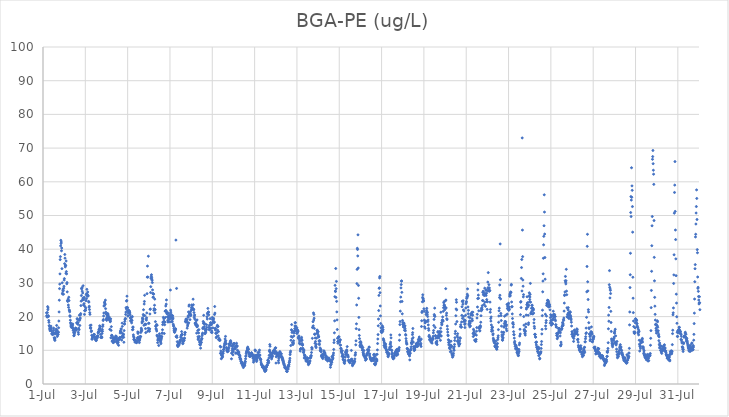
| Category | BGA-PE (ug/L) |
|---|---|
| 44743.166666666664 | 21.12 |
| 44743.177083333336 | 20.3 |
| 44743.1875 | 20.1 |
| 44743.197916666664 | 19.84 |
| 44743.208333333336 | 21.19 |
| 44743.21875 | 22.97 |
| 44743.229166666664 | 22.04 |
| 44743.239583333336 | 22.58 |
| 44743.25 | 20.28 |
| 44743.260416666664 | 20.04 |
| 44743.270833333336 | 18.84 |
| 44743.28125 | 18.29 |
| 44743.291666666664 | 17.28 |
| 44743.302083333336 | 17.31 |
| 44743.3125 | 16.57 |
| 44743.322916666664 | 16.19 |
| 44743.333333333336 | 15.8 |
| 44743.34375 | 16.29 |
| 44743.354166666664 | 16.54 |
| 44743.364583333336 | 16.58 |
| 44743.375 | 17.17 |
| 44743.385416666664 | 16.6 |
| 44743.395833333336 | 16.06 |
| 44743.40625 | 15.74 |
| 44743.416666666664 | 14.85 |
| 44743.427083333336 | 15.03 |
| 44743.4375 | 14.82 |
| 44743.447916666664 | 15.06 |
| 44743.458333333336 | 14.66 |
| 44743.46875 | 15.06 |
| 44743.479166666664 | 15.16 |
| 44743.489583333336 | 15.29 |
| 44743.5 | 16.59 |
| 44743.510416666664 | 15.95 |
| 44743.520833333336 | 14.82 |
| 44743.53125 | 13.74 |
| 44743.541666666664 | 13.53 |
| 44743.552083333336 | 13.15 |
| 44743.5625 | 12.93 |
| 44743.572916666664 | 13.64 |
| 44743.583333333336 | 15.24 |
| 44743.59375 | 15.05 |
| 44743.604166666664 | 14.91 |
| 44743.614583333336 | 15.3 |
| 44743.625 | 16.32 |
| 44743.635416666664 | 15.84 |
| 44743.645833333336 | 17.37 |
| 44743.65625 | 15.28 |
| 44743.666666666664 | 15.95 |
| 44743.677083333336 | 14.12 |
| 44743.6875 | 14.52 |
| 44743.697916666664 | 15.29 |
| 44743.708333333336 | 15.46 |
| 44743.71875 | 14.75 |
| 44743.729166666664 | 15.35 |
| 44743.739583333336 | 16.69 |
| 44743.75 | 18.69 |
| 44743.760416666664 | 21.38 |
| 44743.770833333336 | 24.87 |
| 44743.78125 | 28.3 |
| 44743.791666666664 | 29.64 |
| 44743.802083333336 | 32.67 |
| 44743.8125 | 36.91 |
| 44743.822916666664 | 37.8 |
| 44743.833333333336 | 40.99 |
| 44743.84375 | 42.64 |
| 44743.854166666664 | 41.68 |
| 44743.864583333336 | 42.12 |
| 44743.875 | 39.53 |
| 44743.885416666664 | 40.34 |
| 44743.895833333336 | 34.23 |
| 44743.90625 | 30.03 |
| 44743.916666666664 | 26.92 |
| 44743.927083333336 | 26.67 |
| 44743.9375 | 27.62 |
| 44743.947916666664 | 28.14 |
| 44743.958333333336 | 27.69 |
| 44743.96875 | 26.65 |
| 44743.979166666664 | 28.44 |
| 44743.989583333336 | 29 |
| 44744.0 | 30.83 |
| 44744.010416666664 | 31.28 |
| 44744.020833333336 | 35.7 |
| 44744.03125 | 38.43 |
| 44744.041666666664 | 37.33 |
| 44744.052083333336 | 34.75 |
| 44744.0625 | 35.27 |
| 44744.072916666664 | 35.12 |
| 44744.083333333336 | 32.86 |
| 44744.09375 | 36.5 |
| 44744.104166666664 | 33.36 |
| 44744.114583333336 | 32.68 |
| 44744.125 | 29.74 |
| 44744.135416666664 | 30.1 |
| 44744.145833333336 | 27.34 |
| 44744.15625 | 24.76 |
| 44744.166666666664 | 24.5 |
| 44744.177083333336 | 24.77 |
| 44744.1875 | 25.21 |
| 44744.197916666664 | 23.43 |
| 44744.208333333336 | 22.74 |
| 44744.21875 | 25.75 |
| 44744.229166666664 | 24.74 |
| 44744.239583333336 | 21.98 |
| 44744.25 | 21.78 |
| 44744.260416666664 | 21.42 |
| 44744.270833333336 | 20.27 |
| 44744.28125 | 20.04 |
| 44744.291666666664 | 18.94 |
| 44744.302083333336 | 18.18 |
| 44744.3125 | 17.83 |
| 44744.322916666664 | 17.14 |
| 44744.333333333336 | 17.37 |
| 44744.34375 | 16.8 |
| 44744.354166666664 | 17.37 |
| 44744.364583333336 | 17.05 |
| 44744.375 | 16.93 |
| 44744.385416666664 | 16.68 |
| 44744.395833333336 | 17.43 |
| 44744.40625 | 17.81 |
| 44744.416666666664 | 16.69 |
| 44744.427083333336 | 15.87 |
| 44744.4375 | 16.09 |
| 44744.447916666664 | 15.22 |
| 44744.458333333336 | 14.31 |
| 44744.46875 | 14.38 |
| 44744.479166666664 | 14.8 |
| 44744.489583333336 | 15.16 |
| 44744.5 | 15.48 |
| 44744.510416666664 | 16.16 |
| 44744.520833333336 | 16.21 |
| 44744.53125 | 16.24 |
| 44744.541666666664 | 16.63 |
| 44744.552083333336 | 16.45 |
| 44744.5625 | 16.45 |
| 44744.572916666664 | 15.98 |
| 44744.583333333336 | 16.16 |
| 44744.59375 | 18.15 |
| 44744.604166666664 | 18.1 |
| 44744.614583333336 | 19.41 |
| 44744.625 | 19.14 |
| 44744.635416666664 | 18.25 |
| 44744.645833333336 | 17.73 |
| 44744.65625 | 18.2 |
| 44744.666666666664 | 15.34 |
| 44744.677083333336 | 14.76 |
| 44744.6875 | 16.58 |
| 44744.697916666664 | 19.05 |
| 44744.708333333336 | 16.12 |
| 44744.71875 | 20.41 |
| 44744.729166666664 | 18.89 |
| 44744.739583333336 | 17.36 |
| 44744.75 | 19.31 |
| 44744.760416666664 | 19.59 |
| 44744.770833333336 | 20.5 |
| 44744.78125 | 20.89 |
| 44744.791666666664 | 23.27 |
| 44744.802083333336 | 24.59 |
| 44744.8125 | 26.25 |
| 44744.822916666664 | 28.25 |
| 44744.833333333336 | 28.36 |
| 44744.84375 | 28.62 |
| 44744.854166666664 | 27.55 |
| 44744.864583333336 | 24.91 |
| 44744.875 | 27 |
| 44744.885416666664 | 25.48 |
| 44744.895833333336 | 29.16 |
| 44744.90625 | 25.45 |
| 44744.916666666664 | 23.43 |
| 44744.927083333336 | 25.04 |
| 44744.9375 | 23.85 |
| 44744.947916666664 | 25.72 |
| 44744.958333333336 | 20.65 |
| 44744.96875 | 21.75 |
| 44744.979166666664 | 23 |
| 44744.989583333336 | 21.85 |
| 44745.0 | 21.78 |
| 44745.010416666664 | 21.91 |
| 44745.020833333336 | 22.55 |
| 44745.03125 | 24.71 |
| 44745.041666666664 | 26.51 |
| 44745.052083333336 | 25.31 |
| 44745.0625 | 26.76 |
| 44745.072916666664 | 28.1 |
| 44745.083333333336 | 26.65 |
| 44745.09375 | 26.04 |
| 44745.104166666664 | 26.41 |
| 44745.114583333336 | 27.31 |
| 44745.125 | 26.12 |
| 44745.135416666664 | 26.16 |
| 44745.15625 | 24.49 |
| 44745.166666666664 | 24.28 |
| 44745.177083333336 | 22.75 |
| 44745.1875 | 23.07 |
| 44745.197916666664 | 22.08 |
| 44745.208333333336 | 21.18 |
| 44745.21875 | 20.66 |
| 44745.229166666664 | 17.36 |
| 44745.239583333336 | 16.55 |
| 44745.25 | 16.7 |
| 44745.260416666664 | 16.62 |
| 44745.270833333336 | 17.48 |
| 44745.28125 | 15.53 |
| 44745.291666666664 | 15.8 |
| 44745.302083333336 | 14.45 |
| 44745.3125 | 13.34 |
| 44745.322916666664 | 13.3 |
| 44745.333333333336 | 13.61 |
| 44745.34375 | 13.98 |
| 44745.354166666664 | 13.91 |
| 44745.364583333336 | 14.03 |
| 44745.375 | 14.39 |
| 44745.385416666664 | 14.34 |
| 44745.395833333336 | 14.31 |
| 44745.40625 | 14.76 |
| 44745.416666666664 | 14.52 |
| 44745.427083333336 | 14.7 |
| 44745.4375 | 13.87 |
| 44745.447916666664 | 13.95 |
| 44745.458333333336 | 13.32 |
| 44745.46875 | 13.54 |
| 44745.479166666664 | 13.24 |
| 44745.489583333336 | 13.26 |
| 44745.5 | 13.09 |
| 44745.510416666664 | 12.85 |
| 44745.520833333336 | 12.98 |
| 44745.53125 | 13.48 |
| 44745.541666666664 | 14.07 |
| 44745.552083333336 | 13.65 |
| 44745.5625 | 13.72 |
| 44745.572916666664 | 14.02 |
| 44745.583333333336 | 14.29 |
| 44745.59375 | 14.28 |
| 44745.604166666664 | 15.15 |
| 44745.614583333336 | 15.24 |
| 44745.625 | 15.62 |
| 44745.635416666664 | 15.48 |
| 44745.645833333336 | 16.12 |
| 44745.65625 | 16.28 |
| 44745.666666666664 | 16.26 |
| 44745.677083333336 | 17.26 |
| 44745.6875 | 16.7 |
| 44745.697916666664 | 16.51 |
| 44745.708333333336 | 17.09 |
| 44745.71875 | 14.73 |
| 44745.729166666664 | 13.81 |
| 44745.739583333336 | 15.75 |
| 44745.75 | 13.98 |
| 44745.760416666664 | 13.86 |
| 44745.770833333336 | 14.04 |
| 44745.78125 | 13.77 |
| 44745.791666666664 | 15 |
| 44745.802083333336 | 16.19 |
| 44745.8125 | 15.63 |
| 44745.822916666664 | 17.09 |
| 44745.833333333336 | 17.55 |
| 44745.84375 | 18.84 |
| 44745.854166666664 | 19.14 |
| 44745.864583333336 | 20.17 |
| 44745.875 | 21.06 |
| 44745.885416666664 | 23.1 |
| 44745.895833333336 | 23.27 |
| 44745.90625 | 24.14 |
| 44745.916666666664 | 24.35 |
| 44745.927083333336 | 23.89 |
| 44745.9375 | 23.58 |
| 44745.947916666664 | 24.89 |
| 44745.958333333336 | 22.36 |
| 44745.96875 | 21.33 |
| 44745.979166666664 | 20.76 |
| 44745.989583333336 | 19.33 |
| 44746.0 | 19.11 |
| 44746.010416666664 | 18.89 |
| 44746.020833333336 | 19.81 |
| 44746.03125 | 20.47 |
| 44746.041666666664 | 20.87 |
| 44746.052083333336 | 20.25 |
| 44746.0625 | 20.9 |
| 44746.072916666664 | 20.62 |
| 44746.083333333336 | 19.77 |
| 44746.09375 | 19.33 |
| 44746.104166666664 | 19.32 |
| 44746.114583333336 | 20.01 |
| 44746.125 | 19.2 |
| 44746.135416666664 | 19.43 |
| 44746.145833333336 | 18.96 |
| 44746.15625 | 16.22 |
| 44746.166666666664 | 19.38 |
| 44746.177083333336 | 18.47 |
| 44746.1875 | 18.71 |
| 44746.197916666664 | 19.33 |
| 44746.208333333336 | 13.71 |
| 44746.21875 | 15.91 |
| 44746.229166666664 | 17.01 |
| 44746.239583333336 | 14.35 |
| 44746.25 | 14.47 |
| 44746.260416666664 | 14.36 |
| 44746.270833333336 | 12.67 |
| 44746.28125 | 12.88 |
| 44746.291666666664 | 12.73 |
| 44746.302083333336 | 13.62 |
| 44746.3125 | 12.31 |
| 44746.322916666664 | 12.81 |
| 44746.333333333336 | 12.29 |
| 44746.34375 | 13.82 |
| 44746.354166666664 | 13.52 |
| 44746.364583333336 | 12.58 |
| 44746.375 | 13.25 |
| 44746.385416666664 | 13.51 |
| 44746.395833333336 | 13.51 |
| 44746.40625 | 13.75 |
| 44746.416666666664 | 13.28 |
| 44746.427083333336 | 13.3 |
| 44746.4375 | 14.24 |
| 44746.447916666664 | 13.61 |
| 44746.458333333336 | 12.53 |
| 44746.46875 | 14.11 |
| 44746.479166666664 | 13.69 |
| 44746.489583333336 | 13.25 |
| 44746.5 | 12.7 |
| 44746.510416666664 | 12.62 |
| 44746.520833333336 | 11.98 |
| 44746.53125 | 12.93 |
| 44746.541666666664 | 12.23 |
| 44746.552083333336 | 12.44 |
| 44746.5625 | 13.29 |
| 44746.572916666664 | 11.48 |
| 44746.583333333336 | 13.48 |
| 44746.59375 | 13.54 |
| 44746.604166666664 | 13.26 |
| 44746.614583333336 | 13.24 |
| 44746.625 | 13.83 |
| 44746.635416666664 | 13.76 |
| 44746.645833333336 | 15.13 |
| 44746.65625 | 15.73 |
| 44746.666666666664 | 15.51 |
| 44746.677083333336 | 15.51 |
| 44746.6875 | 16.35 |
| 44746.697916666664 | 16.3 |
| 44746.708333333336 | 13.96 |
| 44746.71875 | 13.03 |
| 44746.729166666664 | 15.12 |
| 44746.739583333336 | 18.06 |
| 44746.75 | 17.1 |
| 44746.760416666664 | 13.79 |
| 44746.770833333336 | 14.31 |
| 44746.78125 | 14.35 |
| 44746.791666666664 | 14.74 |
| 44746.802083333336 | 14.79 |
| 44746.8125 | 13.85 |
| 44746.822916666664 | 12.39 |
| 44746.833333333336 | 15.85 |
| 44746.84375 | 17.89 |
| 44746.854166666664 | 17.76 |
| 44746.864583333336 | 18.56 |
| 44746.875 | 19.12 |
| 44746.885416666664 | 19.3 |
| 44746.895833333336 | 19.47 |
| 44746.90625 | 20.65 |
| 44746.916666666664 | 21.34 |
| 44746.927083333336 | 22.67 |
| 44746.9375 | 22.31 |
| 44746.947916666664 | 24.6 |
| 44746.958333333336 | 24.77 |
| 44746.96875 | 26.06 |
| 44746.979166666664 | 22.76 |
| 44746.989583333336 | 21.73 |
| 44747.0 | 22.61 |
| 44747.010416666664 | 20.21 |
| 44747.020833333336 | 20.21 |
| 44747.03125 | 21.06 |
| 44747.041666666664 | 21.89 |
| 44747.052083333336 | 21.44 |
| 44747.0625 | 21.74 |
| 44747.072916666664 | 21.46 |
| 44747.083333333336 | 21.64 |
| 44747.09375 | 21.24 |
| 44747.104166666664 | 21.06 |
| 44747.114583333336 | 20.53 |
| 44747.125 | 19.59 |
| 44747.135416666664 | 18.73 |
| 44747.145833333336 | 19.73 |
| 44747.15625 | 19.72 |
| 44747.166666666664 | 19.01 |
| 44747.177083333336 | 18.78 |
| 44747.1875 | 18.14 |
| 44747.197916666664 | 19.77 |
| 44747.208333333336 | 18.87 |
| 44747.21875 | 20.04 |
| 44747.229166666664 | 16.11 |
| 44747.239583333336 | 16.84 |
| 44747.25 | 16.2 |
| 44747.260416666664 | 16.9 |
| 44747.270833333336 | 14.58 |
| 44747.28125 | 14.1 |
| 44747.291666666664 | 13.21 |
| 44747.302083333336 | 13.72 |
| 44747.3125 | 13.25 |
| 44747.322916666664 | 13.03 |
| 44747.333333333336 | 12.99 |
| 44747.34375 | 12.43 |
| 44747.354166666664 | 12.78 |
| 44747.364583333336 | 12.63 |
| 44747.375 | 12.61 |
| 44747.385416666664 | 12.9 |
| 44747.395833333336 | 12.65 |
| 44747.40625 | 12.33 |
| 44747.416666666664 | 12.27 |
| 44747.427083333336 | 12.32 |
| 44747.4375 | 12.52 |
| 44747.447916666664 | 12.81 |
| 44747.458333333336 | 13.45 |
| 44747.46875 | 13.76 |
| 44747.479166666664 | 15.45 |
| 44747.489583333336 | 15 |
| 44747.5 | 15.3 |
| 44747.510416666664 | 13.9 |
| 44747.520833333336 | 13.33 |
| 44747.53125 | 13.47 |
| 44747.541666666664 | 12.84 |
| 44747.552083333336 | 12.28 |
| 44747.5625 | 12.94 |
| 44747.572916666664 | 13.34 |
| 44747.583333333336 | 13.63 |
| 44747.59375 | 14.11 |
| 44747.604166666664 | 14.06 |
| 44747.614583333336 | 14.09 |
| 44747.625 | 15.29 |
| 44747.635416666664 | 15.69 |
| 44747.645833333336 | 16.56 |
| 44747.65625 | 16.18 |
| 44747.666666666664 | 15.82 |
| 44747.677083333336 | 18.13 |
| 44747.6875 | 18.58 |
| 44747.697916666664 | 19.57 |
| 44747.708333333336 | 19.23 |
| 44747.71875 | 18.59 |
| 44747.729166666664 | 19.34 |
| 44747.739583333336 | 20.62 |
| 44747.75 | 22.04 |
| 44747.760416666664 | 20.27 |
| 44747.770833333336 | 17.42 |
| 44747.78125 | 23.73 |
| 44747.791666666664 | 24.49 |
| 44747.802083333336 | 26.32 |
| 44747.8125 | 20.3 |
| 44747.822916666664 | 17.81 |
| 44747.833333333336 | 17.66 |
| 44747.84375 | 16.43 |
| 44747.854166666664 | 15.24 |
| 44747.864583333336 | 17.7 |
| 44747.875 | 19.24 |
| 44747.885416666664 | 18.94 |
| 44747.895833333336 | 19.64 |
| 44747.90625 | 21.08 |
| 44747.916666666664 | 26.81 |
| 44747.927083333336 | 31.72 |
| 44747.9375 | 34.99 |
| 44747.947916666664 | 15.63 |
| 44747.958333333336 | 31.72 |
| 44747.96875 | 16.55 |
| 44747.979166666664 | 37.92 |
| 44747.989583333336 | 18.04 |
| 44748.0 | 15.9 |
| 44748.010416666664 | 18 |
| 44748.020833333336 | 16.32 |
| 44748.03125 | 15.63 |
| 44748.041666666664 | 16.37 |
| 44748.052083333336 | 20.78 |
| 44748.0625 | 22.17 |
| 44748.072916666664 | 22.23 |
| 44748.083333333336 | 27.14 |
| 44748.09375 | 28.88 |
| 44748.104166666664 | 31.34 |
| 44748.114583333336 | 31.96 |
| 44748.125 | 32.43 |
| 44748.135416666664 | 31.63 |
| 44748.145833333336 | 31.12 |
| 44748.15625 | 30.76 |
| 44748.166666666664 | 30.1 |
| 44748.177083333336 | 27.92 |
| 44748.1875 | 26.81 |
| 44748.197916666664 | 25.73 |
| 44748.208333333336 | 26.84 |
| 44748.21875 | 25.73 |
| 44748.229166666664 | 26.65 |
| 44748.239583333336 | 21.86 |
| 44748.25 | 22.33 |
| 44748.260416666664 | 22.29 |
| 44748.270833333336 | 23.37 |
| 44748.28125 | 25.19 |
| 44748.291666666664 | 21.13 |
| 44748.302083333336 | 22.06 |
| 44748.3125 | 18.51 |
| 44748.322916666664 | 17.15 |
| 44748.333333333336 | 17.21 |
| 44748.34375 | 16.46 |
| 44748.354166666664 | 16.16 |
| 44748.364583333336 | 17.65 |
| 44748.375 | 15.72 |
| 44748.385416666664 | 14.47 |
| 44748.395833333336 | 17.44 |
| 44748.40625 | 14.1 |
| 44748.416666666664 | 12.26 |
| 44748.427083333336 | 12.99 |
| 44748.4375 | 13.17 |
| 44748.447916666664 | 13.48 |
| 44748.458333333336 | 13.05 |
| 44748.46875 | 11.43 |
| 44748.479166666664 | 13.39 |
| 44748.489583333336 | 14.14 |
| 44748.5 | 14.89 |
| 44748.510416666664 | 14.38 |
| 44748.520833333336 | 13 |
| 44748.53125 | 14.2 |
| 44748.541666666664 | 13.62 |
| 44748.552083333336 | 12.72 |
| 44748.5625 | 12.38 |
| 44748.572916666664 | 11.97 |
| 44748.583333333336 | 13.08 |
| 44748.59375 | 13.48 |
| 44748.604166666664 | 14.14 |
| 44748.614583333336 | 14 |
| 44748.625 | 15.03 |
| 44748.635416666664 | 15.17 |
| 44748.645833333336 | 16.1 |
| 44748.65625 | 17.61 |
| 44748.666666666664 | 18.29 |
| 44748.677083333336 | 18.42 |
| 44748.6875 | 19.79 |
| 44748.697916666664 | 18.38 |
| 44748.708333333336 | 19.33 |
| 44748.71875 | 18.58 |
| 44748.729166666664 | 14.98 |
| 44748.739583333336 | 18.33 |
| 44748.75 | 17.59 |
| 44748.760416666664 | 18.35 |
| 44748.770833333336 | 21.61 |
| 44748.78125 | 19.73 |
| 44748.791666666664 | 21.61 |
| 44748.802083333336 | 23.15 |
| 44748.8125 | 21.82 |
| 44748.822916666664 | 23.7 |
| 44748.833333333336 | 24.94 |
| 44748.84375 | 21.17 |
| 44748.854166666664 | 20.98 |
| 44748.864583333336 | 20.79 |
| 44748.875 | 21.3 |
| 44748.885416666664 | 19.96 |
| 44748.895833333336 | 18.93 |
| 44748.90625 | 18.37 |
| 44748.916666666664 | 18.54 |
| 44748.927083333336 | 19.57 |
| 44748.9375 | 19.85 |
| 44748.947916666664 | 20.93 |
| 44748.958333333336 | 20.19 |
| 44748.96875 | 20.29 |
| 44748.979166666664 | 20.09 |
| 44748.989583333336 | 19.21 |
| 44749.0 | 18.43 |
| 44749.010416666664 | 20.25 |
| 44749.020833333336 | 27.88 |
| 44749.03125 | 21.89 |
| 44749.041666666664 | 21.33 |
| 44749.052083333336 | 20.72 |
| 44749.0625 | 19.86 |
| 44749.072916666664 | 19.49 |
| 44749.083333333336 | 19.68 |
| 44749.09375 | 18.44 |
| 44749.104166666664 | 18.63 |
| 44749.114583333336 | 20.27 |
| 44749.125 | 20.24 |
| 44749.135416666664 | 19.29 |
| 44749.145833333336 | 19.57 |
| 44749.15625 | 17.74 |
| 44749.166666666664 | 17.33 |
| 44749.177083333336 | 17.05 |
| 44749.1875 | 16.41 |
| 44749.197916666664 | 15.91 |
| 44749.208333333336 | 15.5 |
| 44749.21875 | 15.32 |
| 44749.229166666664 | 16 |
| 44749.239583333336 | 15.67 |
| 44749.25 | 15.96 |
| 44749.260416666664 | 16.42 |
| 44749.270833333336 | 16.29 |
| 44749.28125 | 42.71 |
| 44749.291666666664 | 14.03 |
| 44749.302083333336 | 13.98 |
| 44749.3125 | 28.36 |
| 44749.322916666664 | 14.31 |
| 44749.333333333336 | 13.84 |
| 44749.34375 | 12.56 |
| 44749.354166666664 | 11.55 |
| 44749.364583333336 | 11.34 |
| 44749.375 | 11.11 |
| 44749.385416666664 | 11.39 |
| 44749.395833333336 | 12 |
| 44749.40625 | 12.1 |
| 44749.416666666664 | 11.46 |
| 44749.427083333336 | 11.69 |
| 44749.4375 | 11.95 |
| 44749.447916666664 | 12.26 |
| 44749.458333333336 | 12.47 |
| 44749.46875 | 12.78 |
| 44749.479166666664 | 12.88 |
| 44749.489583333336 | 13.12 |
| 44749.5 | 13.03 |
| 44749.510416666664 | 13.91 |
| 44749.520833333336 | 13.97 |
| 44749.53125 | 14.49 |
| 44749.541666666664 | 14.42 |
| 44749.552083333336 | 15.55 |
| 44749.5625 | 14.69 |
| 44749.572916666664 | 14.75 |
| 44749.583333333336 | 13.46 |
| 44749.59375 | 12.51 |
| 44749.604166666664 | 11.96 |
| 44749.614583333336 | 12.11 |
| 44749.625 | 12.52 |
| 44749.635416666664 | 12.73 |
| 44749.645833333336 | 12.88 |
| 44749.65625 | 12.96 |
| 44749.666666666664 | 13.02 |
| 44749.677083333336 | 13.47 |
| 44749.6875 | 13.63 |
| 44749.697916666664 | 14.64 |
| 44749.708333333336 | 15.22 |
| 44749.71875 | 15.28 |
| 44749.729166666664 | 18.63 |
| 44749.739583333336 | 18.45 |
| 44749.75 | 19.23 |
| 44749.760416666664 | 18.41 |
| 44749.770833333336 | 18.56 |
| 44749.78125 | 19.25 |
| 44749.791666666664 | 19.1 |
| 44749.802083333336 | 18.99 |
| 44749.8125 | 16.57 |
| 44749.822916666664 | 18.2 |
| 44749.833333333336 | 17.22 |
| 44749.84375 | 17.59 |
| 44749.854166666664 | 20.15 |
| 44749.864583333336 | 19.82 |
| 44749.875 | 21.38 |
| 44749.885416666664 | 18.15 |
| 44749.895833333336 | 23.12 |
| 44749.90625 | 23.45 |
| 44749.916666666664 | 20.65 |
| 44749.927083333336 | 20.79 |
| 44749.9375 | 20.92 |
| 44749.947916666664 | 19.1 |
| 44749.958333333336 | 21.36 |
| 44749.96875 | 20.24 |
| 44749.979166666664 | 20.66 |
| 44749.989583333336 | 20.42 |
| 44750.0 | 21.8 |
| 44750.010416666664 | 22.67 |
| 44750.020833333336 | 22.12 |
| 44750.03125 | 23.47 |
| 44750.041666666664 | 23.33 |
| 44750.052083333336 | 22.19 |
| 44750.0625 | 23.29 |
| 44750.072916666664 | 22.37 |
| 44750.083333333336 | 22.39 |
| 44750.09375 | 25.17 |
| 44750.104166666664 | 23.51 |
| 44750.114583333336 | 22.2 |
| 44750.125 | 22.03 |
| 44750.135416666664 | 21.2 |
| 44750.145833333336 | 19.69 |
| 44750.15625 | 20.18 |
| 44750.166666666664 | 20.52 |
| 44750.177083333336 | 19.23 |
| 44750.1875 | 18.08 |
| 44750.197916666664 | 18.03 |
| 44750.208333333336 | 17.77 |
| 44750.21875 | 17.47 |
| 44750.229166666664 | 18.06 |
| 44750.239583333336 | 18.77 |
| 44750.25 | 17.7 |
| 44750.260416666664 | 15.1 |
| 44750.270833333336 | 16.99 |
| 44750.28125 | 19.02 |
| 44750.291666666664 | 17 |
| 44750.302083333336 | 17.39 |
| 44750.3125 | 15.85 |
| 44750.322916666664 | 14.02 |
| 44750.333333333336 | 13.18 |
| 44750.34375 | 13.47 |
| 44750.354166666664 | 15.15 |
| 44750.364583333336 | 16.12 |
| 44750.375 | 14.06 |
| 44750.385416666664 | 14 |
| 44750.395833333336 | 12.45 |
| 44750.40625 | 11.76 |
| 44750.416666666664 | 12.77 |
| 44750.427083333336 | 11.56 |
| 44750.4375 | 11.67 |
| 44750.447916666664 | 10.64 |
| 44750.458333333336 | 12.67 |
| 44750.46875 | 12.32 |
| 44750.479166666664 | 12.27 |
| 44750.489583333336 | 13.11 |
| 44750.5 | 13.53 |
| 44750.510416666664 | 13.43 |
| 44750.520833333336 | 14.33 |
| 44750.53125 | 14.81 |
| 44750.541666666664 | 15.11 |
| 44750.552083333336 | 16.43 |
| 44750.5625 | 16.74 |
| 44750.572916666664 | 18.55 |
| 44750.583333333336 | 17.98 |
| 44750.59375 | 20.38 |
| 44750.604166666664 | 18.08 |
| 44750.614583333336 | 18.05 |
| 44750.625 | 17.06 |
| 44750.635416666664 | 16.38 |
| 44750.645833333336 | 17.82 |
| 44750.65625 | 14.91 |
| 44750.666666666664 | 15.16 |
| 44750.677083333336 | 15.83 |
| 44750.6875 | 15.3 |
| 44750.697916666664 | 15.76 |
| 44750.708333333336 | 16.02 |
| 44750.71875 | 16.23 |
| 44750.729166666664 | 17.58 |
| 44750.739583333336 | 16.79 |
| 44750.75 | 19.96 |
| 44750.760416666664 | 19.29 |
| 44750.770833333336 | 20.98 |
| 44750.78125 | 20.72 |
| 44750.791666666664 | 22.43 |
| 44750.802083333336 | 21.11 |
| 44750.8125 | 21.32 |
| 44750.822916666664 | 21.33 |
| 44750.833333333336 | 20.52 |
| 44750.84375 | 16.81 |
| 44750.854166666664 | 16.15 |
| 44750.864583333336 | 17.42 |
| 44750.875 | 16.06 |
| 44750.885416666664 | 16.5 |
| 44750.895833333336 | 19.4 |
| 44750.90625 | 17.47 |
| 44750.916666666664 | 18.12 |
| 44750.927083333336 | 18.21 |
| 44750.9375 | 17.56 |
| 44750.947916666664 | 16.53 |
| 44750.958333333336 | 15.33 |
| 44750.96875 | 17.67 |
| 44750.979166666664 | 15.71 |
| 44750.989583333336 | 15.27 |
| 44751.0 | 19.73 |
| 44751.010416666664 | 19.12 |
| 44751.020833333336 | 18.26 |
| 44751.03125 | 16.65 |
| 44751.041666666664 | 18.32 |
| 44751.052083333336 | 19.16 |
| 44751.0625 | 19.49 |
| 44751.072916666664 | 18.39 |
| 44751.083333333336 | 18.5 |
| 44751.09375 | 18.26 |
| 44751.104166666664 | 20.6 |
| 44751.114583333336 | 22.99 |
| 44751.125 | 21.04 |
| 44751.135416666664 | 16.52 |
| 44751.145833333336 | 16.03 |
| 44751.15625 | 16.41 |
| 44751.166666666664 | 15.09 |
| 44751.177083333336 | 15.01 |
| 44751.1875 | 13.74 |
| 44751.197916666664 | 15.23 |
| 44751.208333333336 | 14.06 |
| 44751.21875 | 15.15 |
| 44751.229166666664 | 17.12 |
| 44751.239583333336 | 17.42 |
| 44751.25 | 15.99 |
| 44751.260416666664 | 17.01 |
| 44751.270833333336 | 17.12 |
| 44751.28125 | 14.28 |
| 44751.291666666664 | 15.56 |
| 44751.302083333336 | 13.15 |
| 44751.3125 | 13.15 |
| 44751.322916666664 | 13.56 |
| 44751.333333333336 | 13.14 |
| 44751.34375 | 12.95 |
| 44751.354166666664 | 12.94 |
| 44751.364583333336 | 13.08 |
| 44751.375 | 11.19 |
| 44751.385416666664 | 9.1 |
| 44751.395833333336 | 10.98 |
| 44751.40625 | 9.79 |
| 44751.416666666664 | 9.05 |
| 44751.427083333336 | 7.49 |
| 44751.4375 | 8.48 |
| 44751.447916666664 | 8.63 |
| 44751.458333333336 | 7.78 |
| 44751.46875 | 8.99 |
| 44751.479166666664 | 8.38 |
| 44751.489583333336 | 8.06 |
| 44751.5 | 9.18 |
| 44751.510416666664 | 9.05 |
| 44751.520833333336 | 9.62 |
| 44751.53125 | 10.24 |
| 44751.541666666664 | 10.24 |
| 44751.552083333336 | 11.05 |
| 44751.5625 | 10.83 |
| 44751.572916666664 | 11.51 |
| 44751.583333333336 | 11.9 |
| 44751.59375 | 12.16 |
| 44751.604166666664 | 13.37 |
| 44751.614583333336 | 12.51 |
| 44751.625 | 14.13 |
| 44751.635416666664 | 12.86 |
| 44751.645833333336 | 11.85 |
| 44751.65625 | 12 |
| 44751.666666666664 | 10.83 |
| 44751.677083333336 | 10.43 |
| 44751.6875 | 9.9 |
| 44751.697916666664 | 9.82 |
| 44751.708333333336 | 9.74 |
| 44751.71875 | 9.58 |
| 44751.729166666664 | 10.17 |
| 44751.739583333336 | 9.74 |
| 44751.75 | 10.23 |
| 44751.760416666664 | 9.81 |
| 44751.770833333336 | 10.61 |
| 44751.78125 | 10.92 |
| 44751.791666666664 | 11.62 |
| 44751.802083333336 | 11.85 |
| 44751.8125 | 11.95 |
| 44751.822916666664 | 11.94 |
| 44751.833333333336 | 12.14 |
| 44751.84375 | 11.83 |
| 44751.854166666664 | 12.59 |
| 44751.864583333336 | 12.87 |
| 44751.875 | 12.13 |
| 44751.885416666664 | 12.43 |
| 44751.895833333336 | 11.32 |
| 44751.90625 | 7.47 |
| 44751.916666666664 | 9.11 |
| 44751.927083333336 | 9.26 |
| 44751.9375 | 9.95 |
| 44751.947916666664 | 10.51 |
| 44751.958333333336 | 11.52 |
| 44751.96875 | 11.11 |
| 44751.979166666664 | 8.64 |
| 44751.989583333336 | 9.59 |
| 44752.0 | 11.57 |
| 44752.010416666664 | 11.99 |
| 44752.020833333336 | 10.25 |
| 44752.03125 | 12.04 |
| 44752.041666666664 | 11.95 |
| 44752.052083333336 | 10.53 |
| 44752.0625 | 10.68 |
| 44752.072916666664 | 10.47 |
| 44752.083333333336 | 10.53 |
| 44752.09375 | 11.15 |
| 44752.104166666664 | 9.22 |
| 44752.114583333336 | 11.15 |
| 44752.125 | 9.11 |
| 44752.135416666664 | 11.46 |
| 44752.145833333336 | 12.1 |
| 44752.15625 | 11.28 |
| 44752.166666666664 | 11.11 |
| 44752.177083333336 | 11.31 |
| 44752.1875 | 10.04 |
| 44752.197916666664 | 9.32 |
| 44752.208333333336 | 9.23 |
| 44752.21875 | 9.7 |
| 44752.229166666664 | 9.24 |
| 44752.239583333336 | 8.79 |
| 44752.25 | 9.02 |
| 44752.260416666664 | 9.47 |
| 44752.270833333336 | 8.67 |
| 44752.28125 | 8.49 |
| 44752.291666666664 | 7.85 |
| 44752.302083333336 | 8.44 |
| 44752.3125 | 8.02 |
| 44752.322916666664 | 7.29 |
| 44752.333333333336 | 7.51 |
| 44752.34375 | 7.3 |
| 44752.354166666664 | 6.75 |
| 44752.364583333336 | 6.75 |
| 44752.375 | 6.09 |
| 44752.385416666664 | 6.46 |
| 44752.395833333336 | 6.34 |
| 44752.40625 | 6.15 |
| 44752.416666666664 | 6.34 |
| 44752.427083333336 | 5.44 |
| 44752.4375 | 5.85 |
| 44752.447916666664 | 5.96 |
| 44752.458333333336 | 5.53 |
| 44752.46875 | 4.88 |
| 44752.479166666664 | 5.45 |
| 44752.489583333336 | 5.47 |
| 44752.5 | 5.29 |
| 44752.510416666664 | 5.79 |
| 44752.520833333336 | 5.72 |
| 44752.53125 | 5.46 |
| 44752.541666666664 | 6.16 |
| 44752.552083333336 | 6.74 |
| 44752.5625 | 6.57 |
| 44752.572916666664 | 7.47 |
| 44752.583333333336 | 8.19 |
| 44752.59375 | 8.38 |
| 44752.604166666664 | 9.02 |
| 44752.614583333336 | 9.45 |
| 44752.625 | 9.5 |
| 44752.635416666664 | 9.82 |
| 44752.645833333336 | 10.02 |
| 44752.65625 | 10.65 |
| 44752.666666666664 | 10.43 |
| 44752.677083333336 | 10.96 |
| 44752.6875 | 10.62 |
| 44752.697916666664 | 10.2 |
| 44752.708333333336 | 10.33 |
| 44752.71875 | 9.42 |
| 44752.729166666664 | 8.87 |
| 44752.739583333336 | 9.23 |
| 44752.75 | 8.79 |
| 44752.760416666664 | 8.18 |
| 44752.770833333336 | 8.27 |
| 44752.78125 | 8.26 |
| 44752.791666666664 | 8.45 |
| 44752.802083333336 | 8.42 |
| 44752.8125 | 8.24 |
| 44752.822916666664 | 8.37 |
| 44752.833333333336 | 8.69 |
| 44752.84375 | 9.2 |
| 44752.854166666664 | 9.21 |
| 44752.864583333336 | 9.19 |
| 44752.875 | 8.83 |
| 44752.885416666664 | 8.86 |
| 44752.895833333336 | 8.73 |
| 44752.90625 | 8.71 |
| 44752.916666666664 | 8.07 |
| 44752.927083333336 | 7.57 |
| 44752.9375 | 7.77 |
| 44752.947916666664 | 6.48 |
| 44752.958333333336 | 6.92 |
| 44752.96875 | 8.5 |
| 44752.979166666664 | 8.15 |
| 44752.989583333336 | 7.1 |
| 44753.0 | 7.26 |
| 44753.010416666664 | 7.57 |
| 44753.020833333336 | 10.11 |
| 44753.03125 | 9.93 |
| 44753.041666666664 | 9.85 |
| 44753.052083333336 | 8.33 |
| 44753.0625 | 7.96 |
| 44753.072916666664 | 8.53 |
| 44753.083333333336 | 8.49 |
| 44753.09375 | 6.68 |
| 44753.104166666664 | 7.51 |
| 44753.114583333336 | 7.11 |
| 44753.125 | 7.82 |
| 44753.135416666664 | 8.45 |
| 44753.145833333336 | 7.85 |
| 44753.15625 | 9.33 |
| 44753.166666666664 | 8.71 |
| 44753.177083333336 | 8.48 |
| 44753.1875 | 8.68 |
| 44753.197916666664 | 8.49 |
| 44753.208333333336 | 8.26 |
| 44753.21875 | 9.46 |
| 44753.229166666664 | 10.06 |
| 44753.239583333336 | 8.51 |
| 44753.25 | 8.61 |
| 44753.260416666664 | 7.61 |
| 44753.270833333336 | 7.47 |
| 44753.28125 | 7.17 |
| 44753.291666666664 | 7.24 |
| 44753.302083333336 | 6.49 |
| 44753.3125 | 5.93 |
| 44753.322916666664 | 5.91 |
| 44753.333333333336 | 5.7 |
| 44753.34375 | 5.56 |
| 44753.354166666664 | 5.4 |
| 44753.364583333336 | 5.02 |
| 44753.375 | 5.09 |
| 44753.385416666664 | 5.09 |
| 44753.395833333336 | 4.95 |
| 44753.40625 | 5.32 |
| 44753.416666666664 | 5.16 |
| 44753.427083333336 | 5.03 |
| 44753.4375 | 4.45 |
| 44753.447916666664 | 4.55 |
| 44753.458333333336 | 4.56 |
| 44753.46875 | 3.99 |
| 44753.479166666664 | 4.71 |
| 44753.489583333336 | 3.72 |
| 44753.5 | 3.87 |
| 44753.510416666664 | 4.14 |
| 44753.520833333336 | 4.21 |
| 44753.53125 | 3.95 |
| 44753.541666666664 | 4.33 |
| 44753.552083333336 | 4.91 |
| 44753.5625 | 5.07 |
| 44753.572916666664 | 5.36 |
| 44753.583333333336 | 5.55 |
| 44753.59375 | 5.52 |
| 44753.604166666664 | 5.72 |
| 44753.614583333336 | 6.29 |
| 44753.625 | 7.09 |
| 44753.635416666664 | 7.02 |
| 44753.645833333336 | 6.95 |
| 44753.65625 | 6.75 |
| 44753.666666666664 | 6.31 |
| 44753.677083333336 | 7.72 |
| 44753.6875 | 8.5 |
| 44753.697916666664 | 9.73 |
| 44753.708333333336 | 10.06 |
| 44753.71875 | 11.7 |
| 44753.729166666664 | 11.19 |
| 44753.739583333336 | 9.3 |
| 44753.75 | 9.38 |
| 44753.760416666664 | 8.16 |
| 44753.770833333336 | 8.65 |
| 44753.78125 | 8.84 |
| 44753.791666666664 | 8.27 |
| 44753.802083333336 | 7.44 |
| 44753.8125 | 7.8 |
| 44753.822916666664 | 8.06 |
| 44753.833333333336 | 8.57 |
| 44753.84375 | 8.24 |
| 44753.854166666664 | 9.1 |
| 44753.864583333336 | 9.31 |
| 44753.875 | 9.53 |
| 44753.885416666664 | 9.51 |
| 44753.895833333336 | 9.93 |
| 44753.90625 | 9.9 |
| 44753.916666666664 | 9.2 |
| 44753.927083333336 | 9.64 |
| 44753.9375 | 9.75 |
| 44753.947916666664 | 9.17 |
| 44753.958333333336 | 10.45 |
| 44753.96875 | 9.06 |
| 44753.979166666664 | 10.73 |
| 44753.989583333336 | 9.74 |
| 44754.0 | 10.72 |
| 44754.010416666664 | 6.21 |
| 44754.020833333336 | 8.07 |
| 44754.03125 | 9.19 |
| 44754.041666666664 | 9.27 |
| 44754.052083333336 | 8.39 |
| 44754.0625 | 8.71 |
| 44754.072916666664 | 8.68 |
| 44754.083333333336 | 9.2 |
| 44754.09375 | 8.51 |
| 44754.104166666664 | 8.76 |
| 44754.114583333336 | 8.16 |
| 44754.125 | 6.91 |
| 44754.135416666664 | 6.29 |
| 44754.145833333336 | 7.53 |
| 44754.15625 | 8.14 |
| 44754.166666666664 | 8.28 |
| 44754.177083333336 | 9.19 |
| 44754.1875 | 9.46 |
| 44754.197916666664 | 9.61 |
| 44754.208333333336 | 9.1 |
| 44754.21875 | 8.91 |
| 44754.229166666664 | 8.99 |
| 44754.239583333336 | 8.18 |
| 44754.25 | 8.91 |
| 44754.260416666664 | 8.97 |
| 44754.270833333336 | 8 |
| 44754.28125 | 8.18 |
| 44754.291666666664 | 7.82 |
| 44754.302083333336 | 7.89 |
| 44754.3125 | 7.16 |
| 44754.322916666664 | 7.52 |
| 44754.333333333336 | 7.29 |
| 44754.34375 | 6.58 |
| 44754.354166666664 | 6.89 |
| 44754.364583333336 | 6.51 |
| 44754.375 | 5.98 |
| 44754.385416666664 | 6.06 |
| 44754.395833333336 | 5.77 |
| 44754.40625 | 5.51 |
| 44754.416666666664 | 5.4 |
| 44754.427083333336 | 4.91 |
| 44754.4375 | 4.95 |
| 44754.447916666664 | 4.7 |
| 44754.458333333336 | 4.67 |
| 44754.46875 | 4.68 |
| 44754.479166666664 | 4.61 |
| 44754.489583333336 | 4.55 |
| 44754.5 | 4.58 |
| 44754.510416666664 | 3.79 |
| 44754.520833333336 | 3.8 |
| 44754.53125 | 4.37 |
| 44754.541666666664 | 3.71 |
| 44754.552083333336 | 4.9 |
| 44754.5625 | 5.07 |
| 44754.572916666664 | 4.6 |
| 44754.583333333336 | 4.39 |
| 44754.59375 | 5.45 |
| 44754.604166666664 | 5.54 |
| 44754.614583333336 | 5.19 |
| 44754.625 | 5.81 |
| 44754.635416666664 | 6.39 |
| 44754.645833333336 | 6.52 |
| 44754.65625 | 7.04 |
| 44754.666666666664 | 7.64 |
| 44754.677083333336 | 8.72 |
| 44754.6875 | 9.28 |
| 44754.697916666664 | 9.75 |
| 44754.708333333336 | 11.4 |
| 44754.71875 | 12.97 |
| 44754.729166666664 | 14.1 |
| 44754.739583333336 | 16.11 |
| 44754.75 | 17.63 |
| 44754.760416666664 | 15.85 |
| 44754.770833333336 | 15.28 |
| 44754.78125 | 13.88 |
| 44754.791666666664 | 12.3 |
| 44754.802083333336 | 11.85 |
| 44754.8125 | 11.71 |
| 44754.822916666664 | 12.28 |
| 44754.833333333336 | 12.05 |
| 44754.84375 | 12.84 |
| 44754.854166666664 | 14.26 |
| 44754.864583333336 | 15.13 |
| 44754.875 | 15.69 |
| 44754.885416666664 | 15.59 |
| 44754.895833333336 | 16.42 |
| 44754.90625 | 17.22 |
| 44754.916666666664 | 18.18 |
| 44754.927083333336 | 18.19 |
| 44754.9375 | 16.99 |
| 44754.947916666664 | 17.15 |
| 44754.958333333336 | 16.11 |
| 44754.96875 | 16.28 |
| 44754.979166666664 | 15.77 |
| 44754.989583333336 | 15.06 |
| 44755.0 | 16.65 |
| 44755.010416666664 | 15.04 |
| 44755.020833333336 | 15.97 |
| 44755.03125 | 15.37 |
| 44755.041666666664 | 15.93 |
| 44755.052083333336 | 15.61 |
| 44755.0625 | 13.74 |
| 44755.072916666664 | 13.51 |
| 44755.083333333336 | 14.04 |
| 44755.09375 | 14.27 |
| 44755.104166666664 | 13.71 |
| 44755.114583333336 | 12.12 |
| 44755.125 | 13.02 |
| 44755.135416666664 | 12.66 |
| 44755.145833333336 | 11.82 |
| 44755.15625 | 9.77 |
| 44755.166666666664 | 10.33 |
| 44755.177083333336 | 10.43 |
| 44755.1875 | 10.54 |
| 44755.197916666664 | 11.95 |
| 44755.208333333336 | 13.41 |
| 44755.21875 | 13.86 |
| 44755.229166666664 | 12.89 |
| 44755.239583333336 | 13.04 |
| 44755.25 | 12 |
| 44755.260416666664 | 11.49 |
| 44755.270833333336 | 11.62 |
| 44755.28125 | 10.6 |
| 44755.291666666664 | 10.22 |
| 44755.302083333336 | 9.39 |
| 44755.3125 | 9.4 |
| 44755.322916666664 | 10.16 |
| 44755.333333333336 | 9.81 |
| 44755.34375 | 7.72 |
| 44755.354166666664 | 8.71 |
| 44755.364583333336 | 8.35 |
| 44755.375 | 8.44 |
| 44755.385416666664 | 8.3 |
| 44755.395833333336 | 7.91 |
| 44755.40625 | 7.83 |
| 44755.416666666664 | 7.43 |
| 44755.427083333336 | 7.06 |
| 44755.4375 | 6.74 |
| 44755.447916666664 | 6.93 |
| 44755.458333333336 | 7.11 |
| 44755.46875 | 7.61 |
| 44755.479166666664 | 7.79 |
| 44755.489583333336 | 7.72 |
| 44755.5 | 7.35 |
| 44755.510416666664 | 7.66 |
| 44755.520833333336 | 6.68 |
| 44755.53125 | 6.28 |
| 44755.541666666664 | 5.72 |
| 44755.552083333336 | 6.39 |
| 44755.5625 | 6.02 |
| 44755.572916666664 | 6.35 |
| 44755.583333333336 | 6.07 |
| 44755.59375 | 6.67 |
| 44755.604166666664 | 6.69 |
| 44755.614583333336 | 6.88 |
| 44755.625 | 7.84 |
| 44755.635416666664 | 7.68 |
| 44755.645833333336 | 7.82 |
| 44755.65625 | 8.34 |
| 44755.666666666664 | 8.08 |
| 44755.677083333336 | 8.46 |
| 44755.6875 | 9.34 |
| 44755.697916666664 | 10.81 |
| 44755.708333333336 | 10.32 |
| 44755.71875 | 10.65 |
| 44755.729166666664 | 13.55 |
| 44755.739583333336 | 16.72 |
| 44755.75 | 16.91 |
| 44755.760416666664 | 18.48 |
| 44755.770833333336 | 17.26 |
| 44755.78125 | 21.09 |
| 44755.791666666664 | 18.98 |
| 44755.802083333336 | 20.63 |
| 44755.8125 | 19.52 |
| 44755.822916666664 | 16.49 |
| 44755.833333333336 | 14.8 |
| 44755.84375 | 14.71 |
| 44755.854166666664 | 12.07 |
| 44755.864583333336 | 13.66 |
| 44755.875 | 12.62 |
| 44755.885416666664 | 11.28 |
| 44755.895833333336 | 11.08 |
| 44755.90625 | 10.81 |
| 44755.916666666664 | 11.8 |
| 44755.927083333336 | 13.6 |
| 44755.9375 | 15.08 |
| 44755.947916666664 | 15.97 |
| 44755.958333333336 | 15.99 |
| 44755.96875 | 15 |
| 44755.979166666664 | 15.54 |
| 44755.989583333336 | 15.58 |
| 44756.0 | 15.46 |
| 44756.010416666664 | 14.49 |
| 44756.020833333336 | 14.03 |
| 44756.03125 | 13.97 |
| 44756.041666666664 | 12.77 |
| 44756.052083333336 | 11.98 |
| 44756.0625 | 11.66 |
| 44756.072916666664 | 12.88 |
| 44756.083333333336 | 12.68 |
| 44756.09375 | 10.71 |
| 44756.104166666664 | 9.87 |
| 44756.114583333336 | 9.85 |
| 44756.125 | 10.29 |
| 44756.135416666664 | 10.2 |
| 44756.145833333336 | 9.52 |
| 44756.15625 | 8.26 |
| 44756.166666666664 | 8.47 |
| 44756.177083333336 | 8.63 |
| 44756.1875 | 7.92 |
| 44756.197916666664 | 8.03 |
| 44756.208333333336 | 8.33 |
| 44756.21875 | 7.53 |
| 44756.229166666664 | 7.9 |
| 44756.239583333336 | 8.86 |
| 44756.25 | 8.9 |
| 44756.260416666664 | 8.74 |
| 44756.270833333336 | 9.83 |
| 44756.28125 | 9.76 |
| 44756.291666666664 | 9.45 |
| 44756.302083333336 | 9.14 |
| 44756.3125 | 9.27 |
| 44756.322916666664 | 9.13 |
| 44756.333333333336 | 8.78 |
| 44756.34375 | 8.45 |
| 44756.354166666664 | 7.79 |
| 44756.364583333336 | 8.24 |
| 44756.375 | 7.25 |
| 44756.385416666664 | 7.38 |
| 44756.395833333336 | 7.63 |
| 44756.40625 | 8.14 |
| 44756.416666666664 | 7.26 |
| 44756.427083333336 | 7.52 |
| 44756.4375 | 7.57 |
| 44756.447916666664 | 6.82 |
| 44756.458333333336 | 7.05 |
| 44756.46875 | 7.43 |
| 44756.479166666664 | 7.31 |
| 44756.489583333336 | 7.48 |
| 44756.5 | 7.4 |
| 44756.510416666664 | 7.73 |
| 44756.520833333336 | 7.08 |
| 44756.53125 | 7.19 |
| 44756.541666666664 | 7.22 |
| 44756.552083333336 | 6.83 |
| 44756.5625 | 7.21 |
| 44756.572916666664 | 6.88 |
| 44756.583333333336 | 4.96 |
| 44756.59375 | 5.62 |
| 44756.604166666664 | 5.84 |
| 44756.614583333336 | 5.89 |
| 44756.625 | 6.75 |
| 44756.635416666664 | 6.43 |
| 44756.645833333336 | 6.42 |
| 44756.65625 | 8.1 |
| 44756.666666666664 | 7.19 |
| 44756.677083333336 | 8.02 |
| 44756.6875 | 7.41 |
| 44756.697916666664 | 8.48 |
| 44756.708333333336 | 7.69 |
| 44756.71875 | 8.59 |
| 44756.729166666664 | 9.19 |
| 44756.739583333336 | 10.26 |
| 44756.75 | 12.29 |
| 44756.760416666664 | 13.05 |
| 44756.770833333336 | 15.18 |
| 44756.78125 | 18.74 |
| 44756.791666666664 | 25.91 |
| 44756.802083333336 | 29.27 |
| 44756.8125 | 27.58 |
| 44756.822916666664 | 27.43 |
| 44756.833333333336 | 34.27 |
| 44756.84375 | 25.69 |
| 44756.854166666664 | 28.29 |
| 44756.864583333336 | 30.45 |
| 44756.875 | 24.51 |
| 44756.885416666664 | 21.39 |
| 44756.895833333336 | 19.02 |
| 44756.90625 | 16.17 |
| 44756.916666666664 | 13.55 |
| 44756.927083333336 | 12.57 |
| 44756.9375 | 12.09 |
| 44756.947916666664 | 12.67 |
| 44756.958333333336 | 13.75 |
| 44756.96875 | 13.92 |
| 44756.979166666664 | 14 |
| 44756.989583333336 | 13.97 |
| 44757.0 | 12.96 |
| 44757.010416666664 | 12.63 |
| 44757.020833333336 | 12.46 |
| 44757.03125 | 12.91 |
| 44757.041666666664 | 11.59 |
| 44757.052083333336 | 13.14 |
| 44757.0625 | 11.52 |
| 44757.072916666664 | 10.5 |
| 44757.083333333336 | 10.59 |
| 44757.09375 | 9.76 |
| 44757.104166666664 | 9.49 |
| 44757.114583333336 | 9.85 |
| 44757.125 | 9.14 |
| 44757.135416666664 | 8.21 |
| 44757.145833333336 | 9.85 |
| 44757.15625 | 8.33 |
| 44757.166666666664 | 8.77 |
| 44757.177083333336 | 7.36 |
| 44757.1875 | 7.97 |
| 44757.197916666664 | 7.14 |
| 44757.208333333336 | 8.17 |
| 44757.21875 | 7.1 |
| 44757.229166666664 | 6.31 |
| 44757.239583333336 | 6.63 |
| 44757.25 | 6.11 |
| 44757.260416666664 | 6.74 |
| 44757.270833333336 | 7.04 |
| 44757.28125 | 7.94 |
| 44757.291666666664 | 9.47 |
| 44757.302083333336 | 8.73 |
| 44757.3125 | 9.11 |
| 44757.322916666664 | 9.4 |
| 44757.333333333336 | 9.88 |
| 44757.34375 | 9.19 |
| 44757.354166666664 | 10.11 |
| 44757.364583333336 | 9.74 |
| 44757.375 | 11.1 |
| 44757.385416666664 | 8.44 |
| 44757.395833333336 | 8.35 |
| 44757.40625 | 8.61 |
| 44757.416666666664 | 8.3 |
| 44757.427083333336 | 8 |
| 44757.4375 | 7.05 |
| 44757.447916666664 | 7.08 |
| 44757.458333333336 | 6.68 |
| 44757.46875 | 6.56 |
| 44757.479166666664 | 6.65 |
| 44757.489583333336 | 6.51 |
| 44757.5 | 6.27 |
| 44757.510416666664 | 6.54 |
| 44757.520833333336 | 6.73 |
| 44757.53125 | 6.94 |
| 44757.541666666664 | 6.92 |
| 44757.552083333336 | 7.19 |
| 44757.5625 | 7.2 |
| 44757.572916666664 | 9.96 |
| 44757.583333333336 | 6.87 |
| 44757.59375 | 7.42 |
| 44757.604166666664 | 7.01 |
| 44757.614583333336 | 6.06 |
| 44757.625 | 5.43 |
| 44757.635416666664 | 5.64 |
| 44757.645833333336 | 6.8 |
| 44757.65625 | 5.77 |
| 44757.666666666664 | 6.66 |
| 44757.677083333336 | 6.7 |
| 44757.6875 | 6.52 |
| 44757.697916666664 | 6.18 |
| 44757.708333333336 | 6.53 |
| 44757.71875 | 6.62 |
| 44757.729166666664 | 6.76 |
| 44757.739583333336 | 7.44 |
| 44757.75 | 8.5 |
| 44757.760416666664 | 8.78 |
| 44757.770833333336 | 9.29 |
| 44757.78125 | 11.62 |
| 44757.791666666664 | 12.81 |
| 44757.802083333336 | 16.42 |
| 44757.8125 | 17.85 |
| 44757.822916666664 | 23.45 |
| 44757.833333333336 | 29.79 |
| 44757.84375 | 34.02 |
| 44757.854166666664 | 40.27 |
| 44757.864583333336 | 39.91 |
| 44757.875 | 38 |
| 44757.885416666664 | 44.26 |
| 44757.895833333336 | 34.42 |
| 44757.90625 | 29.25 |
| 44757.916666666664 | 25.44 |
| 44757.927083333336 | 19.76 |
| 44757.9375 | 16.12 |
| 44757.947916666664 | 14.41 |
| 44757.958333333336 | 13.46 |
| 44757.96875 | 12.36 |
| 44757.979166666664 | 11.47 |
| 44757.989583333336 | 11.06 |
| 44758.0 | 11.45 |
| 44758.010416666664 | 12.58 |
| 44758.020833333336 | 12.27 |
| 44758.03125 | 11.84 |
| 44758.041666666664 | 11.41 |
| 44758.052083333336 | 10.99 |
| 44758.0625 | 11.34 |
| 44758.072916666664 | 10.98 |
| 44758.083333333336 | 10.64 |
| 44758.09375 | 10.03 |
| 44758.104166666664 | 10.06 |
| 44758.114583333336 | 10.84 |
| 44758.125 | 9.33 |
| 44758.135416666664 | 8.88 |
| 44758.145833333336 | 9.07 |
| 44758.15625 | 8.39 |
| 44758.166666666664 | 9.92 |
| 44758.177083333336 | 8.4 |
| 44758.1875 | 8.29 |
| 44758.197916666664 | 8.19 |
| 44758.208333333336 | 8.01 |
| 44758.21875 | 7.7 |
| 44758.229166666664 | 7.97 |
| 44758.239583333336 | 7.05 |
| 44758.25 | 7.69 |
| 44758.260416666664 | 7.66 |
| 44758.270833333336 | 7.34 |
| 44758.28125 | 7.43 |
| 44758.291666666664 | 8.44 |
| 44758.302083333336 | 8.77 |
| 44758.3125 | 8.95 |
| 44758.322916666664 | 9.06 |
| 44758.333333333336 | 10.21 |
| 44758.34375 | 9.14 |
| 44758.354166666664 | 9.85 |
| 44758.364583333336 | 9.5 |
| 44758.375 | 9.85 |
| 44758.385416666664 | 10.17 |
| 44758.395833333336 | 9.94 |
| 44758.40625 | 10.95 |
| 44758.416666666664 | 10.92 |
| 44758.427083333336 | 8.56 |
| 44758.4375 | 8.96 |
| 44758.447916666664 | 8.11 |
| 44758.458333333336 | 7.8 |
| 44758.46875 | 7.69 |
| 44758.479166666664 | 7.3 |
| 44758.489583333336 | 7.54 |
| 44758.5 | 7.44 |
| 44758.510416666664 | 7.05 |
| 44758.520833333336 | 6.92 |
| 44758.53125 | 7.01 |
| 44758.541666666664 | 6.95 |
| 44758.552083333336 | 7.23 |
| 44758.5625 | 7.26 |
| 44758.572916666664 | 7.35 |
| 44758.583333333336 | 7.25 |
| 44758.59375 | 7.52 |
| 44758.604166666664 | 7.46 |
| 44758.614583333336 | 7.78 |
| 44758.625 | 8.63 |
| 44758.635416666664 | 6.9 |
| 44758.645833333336 | 8.84 |
| 44758.65625 | 7.4 |
| 44758.666666666664 | 6 |
| 44758.677083333336 | 5.89 |
| 44758.6875 | 8.12 |
| 44758.697916666664 | 5.67 |
| 44758.708333333336 | 5.95 |
| 44758.71875 | 6.08 |
| 44758.729166666664 | 6.56 |
| 44758.739583333336 | 8.7 |
| 44758.75 | 7.48 |
| 44758.760416666664 | 7.14 |
| 44758.770833333336 | 7.23 |
| 44758.78125 | 6.84 |
| 44758.791666666664 | 8.83 |
| 44758.802083333336 | 10.12 |
| 44758.8125 | 12.01 |
| 44758.822916666664 | 13.35 |
| 44758.833333333336 | 14.66 |
| 44758.84375 | 17.27 |
| 44758.854166666664 | 19.27 |
| 44758.864583333336 | 21.79 |
| 44758.875 | 26.29 |
| 44758.885416666664 | 28.4 |
| 44758.895833333336 | 28.49 |
| 44758.90625 | 31.47 |
| 44758.916666666664 | 31.91 |
| 44758.927083333336 | 27.1 |
| 44758.9375 | 23.15 |
| 44758.947916666664 | 20.21 |
| 44758.958333333336 | 17.94 |
| 44758.96875 | 16.67 |
| 44758.979166666664 | 15.59 |
| 44758.989583333336 | 15.84 |
| 44759.0 | 15.28 |
| 44759.010416666664 | 15.33 |
| 44759.020833333336 | 15.85 |
| 44759.03125 | 17.3 |
| 44759.041666666664 | 16.78 |
| 44759.052083333336 | 15.6 |
| 44759.0625 | 16.84 |
| 44759.072916666664 | 16.11 |
| 44759.083333333336 | 13.43 |
| 44759.09375 | 13.11 |
| 44759.104166666664 | 12.85 |
| 44759.114583333336 | 11.42 |
| 44759.125 | 12.41 |
| 44759.135416666664 | 12.05 |
| 44759.145833333336 | 10.81 |
| 44759.15625 | 11.27 |
| 44759.166666666664 | 11.09 |
| 44759.177083333336 | 11.67 |
| 44759.1875 | 11.91 |
| 44759.197916666664 | 11.17 |
| 44759.208333333336 | 10.67 |
| 44759.21875 | 10.28 |
| 44759.229166666664 | 10.07 |
| 44759.239583333336 | 9.38 |
| 44759.25 | 9.83 |
| 44759.260416666664 | 9.51 |
| 44759.270833333336 | 9.51 |
| 44759.28125 | 9.39 |
| 44759.291666666664 | 8.85 |
| 44759.302083333336 | 8.29 |
| 44759.3125 | 8.08 |
| 44759.322916666664 | 8.5 |
| 44759.333333333336 | 8.95 |
| 44759.34375 | 8.87 |
| 44759.354166666664 | 9.04 |
| 44759.364583333336 | 10.25 |
| 44759.375 | 10.28 |
| 44759.385416666664 | 10.76 |
| 44759.395833333336 | 11 |
| 44759.40625 | 11.77 |
| 44759.416666666664 | 11.94 |
| 44759.427083333336 | 12.42 |
| 44759.4375 | 14.56 |
| 44759.447916666664 | 13.68 |
| 44759.458333333336 | 11.14 |
| 44759.46875 | 10.12 |
| 44759.479166666664 | 9.91 |
| 44759.489583333336 | 8.78 |
| 44759.5 | 9.24 |
| 44759.510416666664 | 8.1 |
| 44759.520833333336 | 8.15 |
| 44759.53125 | 7.9 |
| 44759.541666666664 | 7.59 |
| 44759.552083333336 | 7.46 |
| 44759.5625 | 7.85 |
| 44759.572916666664 | 8.13 |
| 44759.583333333336 | 8.3 |
| 44759.59375 | 7.73 |
| 44759.604166666664 | 8.41 |
| 44759.614583333336 | 9.03 |
| 44759.625 | 8.97 |
| 44759.635416666664 | 8.65 |
| 44759.645833333336 | 9.42 |
| 44759.65625 | 9.31 |
| 44759.666666666664 | 9.38 |
| 44759.677083333336 | 9.63 |
| 44759.6875 | 9.85 |
| 44759.697916666664 | 10.02 |
| 44759.708333333336 | 8.47 |
| 44759.71875 | 8.8 |
| 44759.729166666664 | 10.31 |
| 44759.739583333336 | 9.6 |
| 44759.75 | 9.01 |
| 44759.760416666664 | 8.72 |
| 44759.770833333336 | 9.8 |
| 44759.78125 | 9.71 |
| 44759.791666666664 | 10.3 |
| 44759.802083333336 | 9.87 |
| 44759.8125 | 10.42 |
| 44759.822916666664 | 10.11 |
| 44759.833333333336 | 10.82 |
| 44759.84375 | 12.98 |
| 44759.854166666664 | 14.57 |
| 44759.864583333336 | 17.63 |
| 44759.875 | 18.54 |
| 44759.885416666664 | 21.62 |
| 44759.895833333336 | 24.41 |
| 44759.90625 | 25.79 |
| 44759.916666666664 | 28.51 |
| 44759.927083333336 | 29.5 |
| 44759.9375 | 30.53 |
| 44759.947916666664 | 30.57 |
| 44759.958333333336 | 27.2 |
| 44759.96875 | 24.5 |
| 44759.979166666664 | 20.82 |
| 44759.989583333336 | 18.86 |
| 44760.0 | 18.16 |
| 44760.010416666664 | 17.69 |
| 44760.020833333336 | 17.59 |
| 44760.03125 | 16.96 |
| 44760.041666666664 | 18.18 |
| 44760.052083333336 | 16.85 |
| 44760.0625 | 17.99 |
| 44760.072916666664 | 17.32 |
| 44760.083333333336 | 15.94 |
| 44760.09375 | 16.95 |
| 44760.104166666664 | 17.3 |
| 44760.114583333336 | 16.37 |
| 44760.125 | 15.79 |
| 44760.135416666664 | 14.68 |
| 44760.145833333336 | 14.49 |
| 44760.15625 | 13.48 |
| 44760.166666666664 | 12.74 |
| 44760.177083333336 | 12.22 |
| 44760.1875 | 11.91 |
| 44760.197916666664 | 11.84 |
| 44760.208333333336 | 10.58 |
| 44760.21875 | 10.41 |
| 44760.229166666664 | 9.54 |
| 44760.239583333336 | 10.41 |
| 44760.25 | 9.72 |
| 44760.260416666664 | 9.18 |
| 44760.270833333336 | 9.56 |
| 44760.28125 | 8.81 |
| 44760.291666666664 | 8.74 |
| 44760.302083333336 | 9.56 |
| 44760.3125 | 8.69 |
| 44760.322916666664 | 8.31 |
| 44760.333333333336 | 7.15 |
| 44760.34375 | 9.44 |
| 44760.354166666664 | 9.06 |
| 44760.364583333336 | 10.02 |
| 44760.375 | 10.12 |
| 44760.385416666664 | 10.35 |
| 44760.395833333336 | 11.03 |
| 44760.40625 | 12.19 |
| 44760.416666666664 | 12.32 |
| 44760.427083333336 | 11.85 |
| 44760.4375 | 12.79 |
| 44760.447916666664 | 13.39 |
| 44760.458333333336 | 14.66 |
| 44760.46875 | 15.24 |
| 44760.479166666664 | 16.47 |
| 44760.489583333336 | 13.76 |
| 44760.5 | 12.43 |
| 44760.510416666664 | 11.08 |
| 44760.520833333336 | 10.56 |
| 44760.53125 | 10.31 |
| 44760.541666666664 | 9.93 |
| 44760.552083333336 | 10.02 |
| 44760.5625 | 10.7 |
| 44760.572916666664 | 10.35 |
| 44760.583333333336 | 10.88 |
| 44760.59375 | 10.88 |
| 44760.604166666664 | 11.17 |
| 44760.614583333336 | 11.36 |
| 44760.625 | 11.5 |
| 44760.635416666664 | 11.94 |
| 44760.645833333336 | 11.96 |
| 44760.65625 | 11.96 |
| 44760.666666666664 | 11.55 |
| 44760.677083333336 | 11.86 |
| 44760.6875 | 11.88 |
| 44760.697916666664 | 11.13 |
| 44760.708333333336 | 11.33 |
| 44760.71875 | 12.46 |
| 44760.729166666664 | 12.21 |
| 44760.739583333336 | 13.18 |
| 44760.75 | 11.93 |
| 44760.760416666664 | 13.04 |
| 44760.770833333336 | 13.59 |
| 44760.78125 | 13.94 |
| 44760.791666666664 | 12.86 |
| 44760.802083333336 | 13 |
| 44760.8125 | 12.74 |
| 44760.822916666664 | 12.98 |
| 44760.833333333336 | 11.64 |
| 44760.84375 | 11.64 |
| 44760.854166666664 | 12.05 |
| 44760.864583333336 | 11.14 |
| 44760.875 | 13.32 |
| 44760.885416666664 | 17.06 |
| 44760.895833333336 | 18.77 |
| 44760.90625 | 21.22 |
| 44760.916666666664 | 21.57 |
| 44760.927083333336 | 24.4 |
| 44760.9375 | 25.7 |
| 44760.947916666664 | 26.47 |
| 44760.958333333336 | 25.37 |
| 44760.96875 | 25.19 |
| 44760.979166666664 | 24.68 |
| 44760.989583333336 | 24.61 |
| 44761.0 | 22.34 |
| 44761.010416666664 | 21.56 |
| 44761.020833333336 | 18.95 |
| 44761.03125 | 17 |
| 44761.041666666664 | 18.72 |
| 44761.052083333336 | 18.11 |
| 44761.0625 | 16.53 |
| 44761.072916666664 | 18.31 |
| 44761.083333333336 | 18.57 |
| 44761.09375 | 18.63 |
| 44761.104166666664 | 20.6 |
| 44761.114583333336 | 21.15 |
| 44761.125 | 21.86 |
| 44761.135416666664 | 22.45 |
| 44761.145833333336 | 21.45 |
| 44761.15625 | 20.64 |
| 44761.166666666664 | 21.18 |
| 44761.177083333336 | 20.04 |
| 44761.1875 | 18.54 |
| 44761.197916666664 | 19.01 |
| 44761.208333333336 | 17.53 |
| 44761.21875 | 16.49 |
| 44761.229166666664 | 15.93 |
| 44761.239583333336 | 14.09 |
| 44761.25 | 14.45 |
| 44761.260416666664 | 14.07 |
| 44761.270833333336 | 13.11 |
| 44761.28125 | 13.27 |
| 44761.291666666664 | 13.63 |
| 44761.302083333336 | 12.87 |
| 44761.3125 | 13.36 |
| 44761.322916666664 | 13.2 |
| 44761.333333333336 | 12.89 |
| 44761.34375 | 12.38 |
| 44761.354166666664 | 12.89 |
| 44761.364583333336 | 12.64 |
| 44761.375 | 13.11 |
| 44761.385416666664 | 12.12 |
| 44761.395833333336 | 13.35 |
| 44761.40625 | 13.46 |
| 44761.416666666664 | 13.65 |
| 44761.427083333336 | 13.21 |
| 44761.4375 | 14.17 |
| 44761.447916666664 | 15.18 |
| 44761.458333333336 | 15.88 |
| 44761.46875 | 17.35 |
| 44761.479166666664 | 19.17 |
| 44761.489583333336 | 20.6 |
| 44761.5 | 20.21 |
| 44761.510416666664 | 22.52 |
| 44761.520833333336 | 20.05 |
| 44761.53125 | 16.77 |
| 44761.541666666664 | 14.33 |
| 44761.552083333336 | 14.33 |
| 44761.5625 | 13.6 |
| 44761.572916666664 | 12.4 |
| 44761.583333333336 | 12.09 |
| 44761.59375 | 11.99 |
| 44761.604166666664 | 12.42 |
| 44761.614583333336 | 12.71 |
| 44761.625 | 11.71 |
| 44761.635416666664 | 13.89 |
| 44761.645833333336 | 13.66 |
| 44761.65625 | 15.38 |
| 44761.666666666664 | 15.56 |
| 44761.677083333336 | 14.22 |
| 44761.6875 | 14.17 |
| 44761.697916666664 | 14.39 |
| 44761.708333333336 | 14.6 |
| 44761.71875 | 13.66 |
| 44761.729166666664 | 14.51 |
| 44761.739583333336 | 15.07 |
| 44761.75 | 15.57 |
| 44761.760416666664 | 14.37 |
| 44761.770833333336 | 14.4 |
| 44761.78125 | 12.96 |
| 44761.791666666664 | 16.53 |
| 44761.802083333336 | 21.29 |
| 44761.8125 | 15.49 |
| 44761.822916666664 | 14.26 |
| 44761.833333333336 | 18.2 |
| 44761.84375 | 17.55 |
| 44761.854166666664 | 17.79 |
| 44761.864583333336 | 18.8 |
| 44761.875 | 19.02 |
| 44761.885416666664 | 19.91 |
| 44761.895833333336 | 18.85 |
| 44761.90625 | 18.64 |
| 44761.916666666664 | 21.57 |
| 44761.927083333336 | 22.64 |
| 44761.9375 | 24.13 |
| 44761.947916666664 | 23.32 |
| 44761.958333333336 | 24.47 |
| 44761.96875 | 23.46 |
| 44761.979166666664 | 23.13 |
| 44761.989583333336 | 22.05 |
| 44762.0 | 22.78 |
| 44762.010416666664 | 22.7 |
| 44762.020833333336 | 24.73 |
| 44762.03125 | 28.29 |
| 44762.041666666664 | 24.91 |
| 44762.052083333336 | 22.57 |
| 44762.0625 | 20.39 |
| 44762.072916666664 | 21.04 |
| 44762.083333333336 | 19.38 |
| 44762.09375 | 19.11 |
| 44762.104166666664 | 17.18 |
| 44762.114583333336 | 16.25 |
| 44762.125 | 15.41 |
| 44762.135416666664 | 14.53 |
| 44762.145833333336 | 14.34 |
| 44762.15625 | 13.14 |
| 44762.166666666664 | 12.31 |
| 44762.177083333336 | 11.61 |
| 44762.1875 | 12.89 |
| 44762.197916666664 | 12.31 |
| 44762.208333333336 | 10.62 |
| 44762.21875 | 10.86 |
| 44762.229166666664 | 11.53 |
| 44762.239583333336 | 10.39 |
| 44762.25 | 9.56 |
| 44762.260416666664 | 11.05 |
| 44762.270833333336 | 11.55 |
| 44762.28125 | 12.7 |
| 44762.291666666664 | 9.72 |
| 44762.302083333336 | 11.02 |
| 44762.3125 | 11.21 |
| 44762.322916666664 | 9 |
| 44762.333333333336 | 8.84 |
| 44762.34375 | 8.43 |
| 44762.354166666664 | 7.96 |
| 44762.364583333336 | 8.68 |
| 44762.375 | 8.65 |
| 44762.385416666664 | 8.37 |
| 44762.395833333336 | 9.11 |
| 44762.40625 | 10.62 |
| 44762.416666666664 | 10.07 |
| 44762.427083333336 | 10 |
| 44762.4375 | 11.06 |
| 44762.447916666664 | 11.74 |
| 44762.458333333336 | 12.91 |
| 44762.46875 | 13.75 |
| 44762.479166666664 | 14.96 |
| 44762.489583333336 | 15.64 |
| 44762.5 | 17.8 |
| 44762.510416666664 | 20.26 |
| 44762.520833333336 | 22.27 |
| 44762.53125 | 25 |
| 44762.541666666664 | 24.25 |
| 44762.552083333336 | 21.99 |
| 44762.5625 | 18.52 |
| 44762.572916666664 | 14.28 |
| 44762.583333333336 | 12.66 |
| 44762.59375 | 14.92 |
| 44762.604166666664 | 13.78 |
| 44762.614583333336 | 12.98 |
| 44762.625 | 12.68 |
| 44762.635416666664 | 11.94 |
| 44762.645833333336 | 12.37 |
| 44762.65625 | 11.3 |
| 44762.666666666664 | 11.8 |
| 44762.677083333336 | 11.74 |
| 44762.6875 | 12.78 |
| 44762.697916666664 | 11.97 |
| 44762.708333333336 | 13.74 |
| 44762.71875 | 13.53 |
| 44762.729166666664 | 17.03 |
| 44762.739583333336 | 17.58 |
| 44762.75 | 16.94 |
| 44762.760416666664 | 16.91 |
| 44762.770833333336 | 16.89 |
| 44762.78125 | 18.39 |
| 44762.791666666664 | 20.37 |
| 44762.802083333336 | 22.93 |
| 44762.8125 | 24.57 |
| 44762.822916666664 | 19.48 |
| 44762.833333333336 | 24.36 |
| 44762.84375 | 23.66 |
| 44762.854166666664 | 24.7 |
| 44762.864583333336 | 21.97 |
| 44762.875 | 20.03 |
| 44762.885416666664 | 18.6 |
| 44762.895833333336 | 21.66 |
| 44762.90625 | 18.58 |
| 44762.916666666664 | 19.03 |
| 44762.927083333336 | 17.68 |
| 44762.9375 | 16.76 |
| 44762.947916666664 | 17.93 |
| 44762.958333333336 | 18.76 |
| 44762.96875 | 20.39 |
| 44762.979166666664 | 22.55 |
| 44762.989583333336 | 23.85 |
| 44763.0 | 24.2 |
| 44763.010416666664 | 24.5 |
| 44763.020833333336 | 25.38 |
| 44763.03125 | 25.87 |
| 44763.041666666664 | 25.6 |
| 44763.052083333336 | 26.64 |
| 44763.0625 | 28.23 |
| 44763.072916666664 | 26.16 |
| 44763.083333333336 | 22.86 |
| 44763.09375 | 20.86 |
| 44763.104166666664 | 21.85 |
| 44763.114583333336 | 19.88 |
| 44763.125 | 17.56 |
| 44763.135416666664 | 17.88 |
| 44763.145833333336 | 18.44 |
| 44763.15625 | 18.69 |
| 44763.166666666664 | 16.96 |
| 44763.177083333336 | 17.95 |
| 44763.1875 | 19.63 |
| 44763.197916666664 | 17.22 |
| 44763.208333333336 | 18.51 |
| 44763.21875 | 20.45 |
| 44763.229166666664 | 20.78 |
| 44763.239583333336 | 20.55 |
| 44763.25 | 20.77 |
| 44763.260416666664 | 21.25 |
| 44763.270833333336 | 20.65 |
| 44763.28125 | 19.29 |
| 44763.291666666664 | 18.79 |
| 44763.302083333336 | 20.39 |
| 44763.3125 | 21.32 |
| 44763.322916666664 | 14.96 |
| 44763.333333333336 | 14.08 |
| 44763.34375 | 16.23 |
| 44763.354166666664 | 15.29 |
| 44763.364583333336 | 15.77 |
| 44763.375 | 14.54 |
| 44763.385416666664 | 14.8 |
| 44763.395833333336 | 13.02 |
| 44763.40625 | 15.01 |
| 44763.416666666664 | 14.7 |
| 44763.427083333336 | 12.74 |
| 44763.4375 | 12.76 |
| 44763.447916666664 | 13.11 |
| 44763.458333333336 | 12.67 |
| 44763.46875 | 13.21 |
| 44763.479166666664 | 14.5 |
| 44763.489583333336 | 15.66 |
| 44763.5 | 16.74 |
| 44763.510416666664 | 19.58 |
| 44763.520833333336 | 20.67 |
| 44763.53125 | 22.85 |
| 44763.541666666664 | 25.35 |
| 44763.552083333336 | 27.9 |
| 44763.5625 | 29.77 |
| 44763.572916666664 | 26.38 |
| 44763.583333333336 | 25.43 |
| 44763.59375 | 21.72 |
| 44763.604166666664 | 16.66 |
| 44763.614583333336 | 16.45 |
| 44763.625 | 16.99 |
| 44763.635416666664 | 15.82 |
| 44763.645833333336 | 15.75 |
| 44763.65625 | 16.63 |
| 44763.666666666664 | 17.32 |
| 44763.677083333336 | 16.98 |
| 44763.6875 | 18.33 |
| 44763.697916666664 | 20.26 |
| 44763.708333333336 | 21.71 |
| 44763.71875 | 22.37 |
| 44763.729166666664 | 21.94 |
| 44763.739583333336 | 22.63 |
| 44763.75 | 22.13 |
| 44763.760416666664 | 23.25 |
| 44763.770833333336 | 24.78 |
| 44763.78125 | 27.19 |
| 44763.791666666664 | 24.71 |
| 44763.802083333336 | 27.53 |
| 44763.8125 | 26.53 |
| 44763.822916666664 | 27.19 |
| 44763.833333333336 | 26.46 |
| 44763.84375 | 23.61 |
| 44763.854166666664 | 26.28 |
| 44763.864583333336 | 26.41 |
| 44763.875 | 28.44 |
| 44763.885416666664 | 24.29 |
| 44763.895833333336 | 26.76 |
| 44763.90625 | 23.07 |
| 44763.916666666664 | 26.65 |
| 44763.927083333336 | 27.78 |
| 44763.9375 | 26.27 |
| 44763.947916666664 | 27.94 |
| 44763.958333333336 | 26.93 |
| 44763.96875 | 25.05 |
| 44763.979166666664 | 24.43 |
| 44763.989583333336 | 22.15 |
| 44764.0 | 24.41 |
| 44764.010416666664 | 27.63 |
| 44764.020833333336 | 30.24 |
| 44764.03125 | 28.59 |
| 44764.041666666664 | 33.05 |
| 44764.052083333336 | 28.32 |
| 44764.0625 | 28.29 |
| 44764.072916666664 | 29.48 |
| 44764.083333333336 | 27.52 |
| 44764.09375 | 28.52 |
| 44764.104166666664 | 27.69 |
| 44764.114583333336 | 27.74 |
| 44764.125 | 24.3 |
| 44764.135416666664 | 21.3 |
| 44764.145833333336 | 22.13 |
| 44764.15625 | 19.44 |
| 44764.166666666664 | 18.67 |
| 44764.177083333336 | 19.91 |
| 44764.1875 | 17.52 |
| 44764.197916666664 | 15.65 |
| 44764.208333333336 | 16.19 |
| 44764.21875 | 16.73 |
| 44764.229166666664 | 16.92 |
| 44764.239583333336 | 16.77 |
| 44764.25 | 15.81 |
| 44764.260416666664 | 14.6 |
| 44764.270833333336 | 14.91 |
| 44764.28125 | 13.58 |
| 44764.291666666664 | 13.11 |
| 44764.302083333336 | 12.7 |
| 44764.3125 | 12.86 |
| 44764.322916666664 | 12.3 |
| 44764.333333333336 | 12.88 |
| 44764.34375 | 12.11 |
| 44764.354166666664 | 11.3 |
| 44764.364583333336 | 11.14 |
| 44764.375 | 11.14 |
| 44764.385416666664 | 10.92 |
| 44764.395833333336 | 11.02 |
| 44764.40625 | 12.73 |
| 44764.416666666664 | 11.91 |
| 44764.427083333336 | 11.65 |
| 44764.4375 | 10.39 |
| 44764.447916666664 | 10.31 |
| 44764.458333333336 | 10.93 |
| 44764.46875 | 11.08 |
| 44764.479166666664 | 12.03 |
| 44764.489583333336 | 13.2 |
| 44764.5 | 13.72 |
| 44764.510416666664 | 14.3 |
| 44764.520833333336 | 16.13 |
| 44764.53125 | 18.31 |
| 44764.541666666664 | 20.18 |
| 44764.552083333336 | 21.72 |
| 44764.5625 | 22.51 |
| 44764.572916666664 | 25.66 |
| 44764.583333333336 | 29.4 |
| 44764.59375 | 26.34 |
| 44764.604166666664 | 41.56 |
| 44764.614583333336 | 30.94 |
| 44764.625 | 25.25 |
| 44764.635416666664 | 20.94 |
| 44764.645833333336 | 20.29 |
| 44764.65625 | 18.83 |
| 44764.666666666664 | 17.18 |
| 44764.677083333336 | 15.41 |
| 44764.6875 | 14.55 |
| 44764.697916666664 | 14.06 |
| 44764.708333333336 | 13.09 |
| 44764.71875 | 12.97 |
| 44764.729166666664 | 13.6 |
| 44764.739583333336 | 13.75 |
| 44764.75 | 14.64 |
| 44764.760416666664 | 15.23 |
| 44764.770833333336 | 15.34 |
| 44764.78125 | 16.88 |
| 44764.791666666664 | 16.94 |
| 44764.802083333336 | 17.96 |
| 44764.8125 | 20.12 |
| 44764.822916666664 | 17.45 |
| 44764.833333333336 | 18.58 |
| 44764.84375 | 18.03 |
| 44764.854166666664 | 18.36 |
| 44764.864583333336 | 18.5 |
| 44764.875 | 20.43 |
| 44764.885416666664 | 17.14 |
| 44764.895833333336 | 16.38 |
| 44764.90625 | 17.54 |
| 44764.916666666664 | 15.81 |
| 44764.927083333336 | 23.63 |
| 44764.9375 | 20.74 |
| 44764.947916666664 | 22.45 |
| 44764.958333333336 | 23.14 |
| 44764.96875 | 22.27 |
| 44764.979166666664 | 23.02 |
| 44764.989583333336 | 23.73 |
| 44765.0 | 23.97 |
| 44765.010416666664 | 21.85 |
| 44765.020833333336 | 22.49 |
| 44765.03125 | 22.89 |
| 44765.041666666664 | 22.14 |
| 44765.052083333336 | 26.06 |
| 44765.0625 | 26.51 |
| 44765.072916666664 | 26.83 |
| 44765.083333333336 | 26.17 |
| 44765.09375 | 27.18 |
| 44765.104166666664 | 27.3 |
| 44765.114583333336 | 27.22 |
| 44765.125 | 29.33 |
| 44765.135416666664 | 29.56 |
| 44765.145833333336 | 24.34 |
| 44765.15625 | 22.88 |
| 44765.166666666664 | 22.97 |
| 44765.177083333336 | 20.8 |
| 44765.1875 | 19.43 |
| 44765.197916666664 | 17.94 |
| 44765.208333333336 | 18.24 |
| 44765.21875 | 16.89 |
| 44765.229166666664 | 17.67 |
| 44765.239583333336 | 15.53 |
| 44765.25 | 14.65 |
| 44765.260416666664 | 14.63 |
| 44765.270833333336 | 13.62 |
| 44765.28125 | 12.25 |
| 44765.291666666664 | 12.66 |
| 44765.302083333336 | 11.8 |
| 44765.3125 | 11.14 |
| 44765.322916666664 | 11.68 |
| 44765.333333333336 | 10.42 |
| 44765.34375 | 11.22 |
| 44765.354166666664 | 10.59 |
| 44765.364583333336 | 11.28 |
| 44765.375 | 10.68 |
| 44765.385416666664 | 10.62 |
| 44765.395833333336 | 9.34 |
| 44765.40625 | 9.79 |
| 44765.416666666664 | 10.39 |
| 44765.427083333336 | 9.28 |
| 44765.4375 | 8.97 |
| 44765.447916666664 | 8.74 |
| 44765.458333333336 | 8.43 |
| 44765.46875 | 8.44 |
| 44765.479166666664 | 9.24 |
| 44765.489583333336 | 10.28 |
| 44765.5 | 9.71 |
| 44765.510416666664 | 11.64 |
| 44765.520833333336 | 12.16 |
| 44765.53125 | 14.24 |
| 44765.541666666664 | 16.25 |
| 44765.552083333336 | 14.83 |
| 44765.5625 | 20.57 |
| 44765.572916666664 | 24.28 |
| 44765.583333333336 | 24.46 |
| 44765.59375 | 22.68 |
| 44765.604166666664 | 31.32 |
| 44765.614583333336 | 34.55 |
| 44765.625 | 36.94 |
| 44765.635416666664 | 27.61 |
| 44765.645833333336 | 73.02 |
| 44765.65625 | 45.67 |
| 44765.666666666664 | 37.8 |
| 44765.677083333336 | 30.86 |
| 44765.6875 | 29.02 |
| 44765.697916666664 | 25.85 |
| 44765.708333333336 | 26.52 |
| 44765.71875 | 20.01 |
| 44765.729166666664 | 17.46 |
| 44765.739583333336 | 16.15 |
| 44765.75 | 15.97 |
| 44765.760416666664 | 15.66 |
| 44765.770833333336 | 14.91 |
| 44765.78125 | 15.1 |
| 44765.791666666664 | 14.51 |
| 44765.802083333336 | 15.69 |
| 44765.8125 | 16.9 |
| 44765.822916666664 | 17.84 |
| 44765.833333333336 | 20.46 |
| 44765.84375 | 22.24 |
| 44765.854166666664 | 22.63 |
| 44765.864583333336 | 23.51 |
| 44765.875 | 25.89 |
| 44765.885416666664 | 23.73 |
| 44765.895833333336 | 24.12 |
| 44765.90625 | 23.43 |
| 44765.916666666664 | 22.85 |
| 44765.927083333336 | 20.39 |
| 44765.9375 | 17.64 |
| 44765.947916666664 | 18.14 |
| 44765.958333333336 | 23.34 |
| 44765.96875 | 26.09 |
| 44765.979166666664 | 27.05 |
| 44765.989583333336 | 24.36 |
| 44766.0 | 25.07 |
| 44766.010416666664 | 25.82 |
| 44766.020833333336 | 26.61 |
| 44766.03125 | 29.85 |
| 44766.041666666664 | 24.29 |
| 44766.052083333336 | 20.81 |
| 44766.0625 | 21.13 |
| 44766.072916666664 | 20.97 |
| 44766.083333333336 | 22.46 |
| 44766.09375 | 21.59 |
| 44766.104166666664 | 23.29 |
| 44766.114583333336 | 23.4 |
| 44766.125 | 22.55 |
| 44766.135416666664 | 22.59 |
| 44766.145833333336 | 20.77 |
| 44766.15625 | 21.91 |
| 44766.166666666664 | 21.96 |
| 44766.177083333336 | 22.25 |
| 44766.1875 | 21.04 |
| 44766.197916666664 | 18.13 |
| 44766.208333333336 | 19.14 |
| 44766.21875 | 17.09 |
| 44766.229166666664 | 16.52 |
| 44766.239583333336 | 14.74 |
| 44766.25 | 14.67 |
| 44766.260416666664 | 14.74 |
| 44766.270833333336 | 13.97 |
| 44766.28125 | 13.9 |
| 44766.291666666664 | 12.38 |
| 44766.302083333336 | 12.28 |
| 44766.3125 | 11.6 |
| 44766.322916666664 | 12.46 |
| 44766.333333333336 | 10.85 |
| 44766.34375 | 11.05 |
| 44766.354166666664 | 10.74 |
| 44766.364583333336 | 10.33 |
| 44766.375 | 9.72 |
| 44766.385416666664 | 9.66 |
| 44766.395833333336 | 9.25 |
| 44766.40625 | 10.64 |
| 44766.416666666664 | 10.91 |
| 44766.427083333336 | 8.4 |
| 44766.4375 | 10.45 |
| 44766.447916666664 | 8.6 |
| 44766.458333333336 | 8.9 |
| 44766.46875 | 7.44 |
| 44766.479166666664 | 7.62 |
| 44766.489583333336 | 9.21 |
| 44766.5 | 9.31 |
| 44766.510416666664 | 9.05 |
| 44766.520833333336 | 9.45 |
| 44766.53125 | 9.55 |
| 44766.541666666664 | 10.56 |
| 44766.552083333336 | 11.7 |
| 44766.5625 | 12.61 |
| 44766.572916666664 | 14.86 |
| 44766.583333333336 | 16.21 |
| 44766.59375 | 20.28 |
| 44766.604166666664 | 21.91 |
| 44766.614583333336 | 27.35 |
| 44766.625 | 30.54 |
| 44766.635416666664 | 32.69 |
| 44766.645833333336 | 37.31 |
| 44766.65625 | 41.3 |
| 44766.666666666664 | 43.82 |
| 44766.677083333336 | 46.96 |
| 44766.6875 | 56.14 |
| 44766.697916666664 | 51.02 |
| 44766.708333333336 | 44.49 |
| 44766.71875 | 37.53 |
| 44766.729166666664 | 31.1 |
| 44766.739583333336 | 20.69 |
| 44766.75 | 17.24 |
| 44766.760416666664 | 16.38 |
| 44766.770833333336 | 18.19 |
| 44766.78125 | 18.83 |
| 44766.791666666664 | 20.16 |
| 44766.802083333336 | 23.28 |
| 44766.8125 | 23.93 |
| 44766.822916666664 | 23.66 |
| 44766.833333333336 | 24.09 |
| 44766.84375 | 24.85 |
| 44766.854166666664 | 24.73 |
| 44766.864583333336 | 24.82 |
| 44766.875 | 24.52 |
| 44766.885416666664 | 22.88 |
| 44766.895833333336 | 24.26 |
| 44766.90625 | 22.99 |
| 44766.916666666664 | 23.65 |
| 44766.927083333336 | 23.2 |
| 44766.9375 | 23.56 |
| 44766.947916666664 | 22.99 |
| 44766.958333333336 | 22 |
| 44766.96875 | 18.06 |
| 44766.979166666664 | 19.7 |
| 44766.989583333336 | 20.55 |
| 44767.0 | 18.86 |
| 44767.010416666664 | 18.45 |
| 44767.020833333336 | 17.45 |
| 44767.03125 | 20.34 |
| 44767.041666666664 | 20.05 |
| 44767.052083333336 | 19.04 |
| 44767.0625 | 17.87 |
| 44767.072916666664 | 17.95 |
| 44767.083333333336 | 17.84 |
| 44767.09375 | 19.03 |
| 44767.104166666664 | 19.29 |
| 44767.114583333336 | 21.6 |
| 44767.125 | 20.65 |
| 44767.135416666664 | 19.83 |
| 44767.145833333336 | 20.57 |
| 44767.15625 | 20.44 |
| 44767.166666666664 | 20.39 |
| 44767.177083333336 | 20.63 |
| 44767.1875 | 20.09 |
| 44767.197916666664 | 19.18 |
| 44767.208333333336 | 20.03 |
| 44767.21875 | 18.76 |
| 44767.229166666664 | 17.58 |
| 44767.239583333336 | 17.57 |
| 44767.25 | 16.91 |
| 44767.260416666664 | 16.93 |
| 44767.270833333336 | 14.98 |
| 44767.28125 | 14.38 |
| 44767.291666666664 | 14.39 |
| 44767.302083333336 | 13.44 |
| 44767.3125 | 15.02 |
| 44767.322916666664 | 13.93 |
| 44767.333333333336 | 14.92 |
| 44767.34375 | 15.21 |
| 44767.354166666664 | 16.47 |
| 44767.364583333336 | 15.34 |
| 44767.375 | 16.49 |
| 44767.385416666664 | 15.9 |
| 44767.395833333336 | 16.49 |
| 44767.40625 | 16.45 |
| 44767.416666666664 | 16.22 |
| 44767.427083333336 | 15.52 |
| 44767.4375 | 14.25 |
| 44767.447916666664 | 15.19 |
| 44767.458333333336 | 11.47 |
| 44767.46875 | 11.32 |
| 44767.479166666664 | 12.42 |
| 44767.489583333336 | 11.81 |
| 44767.5 | 16.12 |
| 44767.510416666664 | 16.48 |
| 44767.520833333336 | 16.37 |
| 44767.53125 | 17.12 |
| 44767.541666666664 | 17.13 |
| 44767.552083333336 | 18.25 |
| 44767.5625 | 17.57 |
| 44767.572916666664 | 17.96 |
| 44767.583333333336 | 17.46 |
| 44767.59375 | 19.1 |
| 44767.604166666664 | 18.86 |
| 44767.614583333336 | 19.58 |
| 44767.625 | 21.63 |
| 44767.635416666664 | 24.01 |
| 44767.645833333336 | 26.26 |
| 44767.65625 | 26.46 |
| 44767.666666666664 | 27.32 |
| 44767.677083333336 | 30.64 |
| 44767.6875 | 31.92 |
| 44767.697916666664 | 30.19 |
| 44767.708333333336 | 29.7 |
| 44767.71875 | 30.63 |
| 44767.729166666664 | 34.03 |
| 44767.739583333336 | 27.56 |
| 44767.75 | 26.5 |
| 44767.760416666664 | 22.61 |
| 44767.770833333336 | 20 |
| 44767.78125 | 19.82 |
| 44767.791666666664 | 20.56 |
| 44767.802083333336 | 20.77 |
| 44767.8125 | 21.99 |
| 44767.822916666664 | 22.66 |
| 44767.833333333336 | 21.14 |
| 44767.84375 | 20.04 |
| 44767.854166666664 | 19.42 |
| 44767.864583333336 | 19.93 |
| 44767.875 | 20.52 |
| 44767.885416666664 | 21.09 |
| 44767.895833333336 | 21.21 |
| 44767.90625 | 21.44 |
| 44767.916666666664 | 21.29 |
| 44767.927083333336 | 20.35 |
| 44767.9375 | 19.94 |
| 44767.947916666664 | 19.45 |
| 44767.958333333336 | 19.04 |
| 44767.96875 | 18.33 |
| 44767.979166666664 | 17.2 |
| 44767.989583333336 | 14.73 |
| 44768.0 | 15.5 |
| 44768.010416666664 | 15.5 |
| 44768.020833333336 | 14.84 |
| 44768.03125 | 14.13 |
| 44768.041666666664 | 13.95 |
| 44768.052083333336 | 14 |
| 44768.0625 | 14.15 |
| 44768.072916666664 | 12.64 |
| 44768.083333333336 | 13.52 |
| 44768.09375 | 14.73 |
| 44768.104166666664 | 14.26 |
| 44768.114583333336 | 15.98 |
| 44768.125 | 15.95 |
| 44768.135416666664 | 15.33 |
| 44768.145833333336 | 15.2 |
| 44768.15625 | 15.19 |
| 44768.166666666664 | 14.91 |
| 44768.177083333336 | 14.94 |
| 44768.1875 | 15.3 |
| 44768.197916666664 | 15.02 |
| 44768.208333333336 | 15.24 |
| 44768.21875 | 15.33 |
| 44768.229166666664 | 16.37 |
| 44768.239583333336 | 15.53 |
| 44768.25 | 16.09 |
| 44768.260416666664 | 13.13 |
| 44768.270833333336 | 14.64 |
| 44768.28125 | 13.28 |
| 44768.291666666664 | 12.42 |
| 44768.302083333336 | 11.44 |
| 44768.3125 | 11.01 |
| 44768.322916666664 | 10.78 |
| 44768.333333333336 | 10.97 |
| 44768.34375 | 10.14 |
| 44768.354166666664 | 10.92 |
| 44768.364583333336 | 9.96 |
| 44768.375 | 10.45 |
| 44768.385416666664 | 9.58 |
| 44768.395833333336 | 10.66 |
| 44768.40625 | 10.62 |
| 44768.416666666664 | 11.36 |
| 44768.427083333336 | 10.35 |
| 44768.4375 | 10.6 |
| 44768.447916666664 | 9.34 |
| 44768.458333333336 | 9.26 |
| 44768.46875 | 8.75 |
| 44768.479166666664 | 8.81 |
| 44768.489583333336 | 8.09 |
| 44768.5 | 9.5 |
| 44768.510416666664 | 9.58 |
| 44768.520833333336 | 8.5 |
| 44768.53125 | 9.55 |
| 44768.541666666664 | 8.47 |
| 44768.552083333336 | 10.29 |
| 44768.5625 | 9.09 |
| 44768.572916666664 | 9.96 |
| 44768.583333333336 | 10.83 |
| 44768.59375 | 10.9 |
| 44768.604166666664 | 9.47 |
| 44768.614583333336 | 12.48 |
| 44768.625 | 12.54 |
| 44768.635416666664 | 13.42 |
| 44768.645833333336 | 14.04 |
| 44768.65625 | 14.97 |
| 44768.666666666664 | 16.59 |
| 44768.677083333336 | 15.21 |
| 44768.6875 | 19.78 |
| 44768.697916666664 | 27.35 |
| 44768.708333333336 | 34.88 |
| 44768.71875 | 40.85 |
| 44768.729166666664 | 44.42 |
| 44768.739583333336 | 30.33 |
| 44768.75 | 27.62 |
| 44768.760416666664 | 25.07 |
| 44768.770833333336 | 22.05 |
| 44768.78125 | 21.38 |
| 44768.791666666664 | 18.19 |
| 44768.802083333336 | 16.69 |
| 44768.8125 | 16.41 |
| 44768.822916666664 | 14.89 |
| 44768.833333333336 | 14.68 |
| 44768.84375 | 14.09 |
| 44768.854166666664 | 12.83 |
| 44768.864583333336 | 13.25 |
| 44768.875 | 14.3 |
| 44768.885416666664 | 15.09 |
| 44768.895833333336 | 15.54 |
| 44768.90625 | 15.32 |
| 44768.916666666664 | 16.94 |
| 44768.927083333336 | 15.37 |
| 44768.9375 | 15.07 |
| 44768.947916666664 | 14.79 |
| 44768.958333333336 | 12.54 |
| 44768.96875 | 12.56 |
| 44768.979166666664 | 13.24 |
| 44768.989583333336 | 13.74 |
| 44769.0 | 13.2 |
| 44769.010416666664 | 13.58 |
| 44769.020833333336 | 13.86 |
| 44769.03125 | 14.15 |
| 44769.041666666664 | 10.78 |
| 44769.052083333336 | 10.81 |
| 44769.0625 | 10.84 |
| 44769.072916666664 | 10.67 |
| 44769.083333333336 | 11 |
| 44769.09375 | 10.13 |
| 44769.104166666664 | 10.22 |
| 44769.114583333336 | 9.74 |
| 44769.125 | 8.9 |
| 44769.135416666664 | 9 |
| 44769.145833333336 | 9.64 |
| 44769.15625 | 9.43 |
| 44769.166666666664 | 9.24 |
| 44769.177083333336 | 9.22 |
| 44769.1875 | 9.07 |
| 44769.197916666664 | 9.94 |
| 44769.208333333336 | 9.94 |
| 44769.21875 | 10.61 |
| 44769.229166666664 | 9.51 |
| 44769.239583333336 | 10.45 |
| 44769.25 | 10.44 |
| 44769.260416666664 | 10.5 |
| 44769.270833333336 | 8.91 |
| 44769.28125 | 9.34 |
| 44769.291666666664 | 8.21 |
| 44769.302083333336 | 9.11 |
| 44769.3125 | 8.79 |
| 44769.322916666664 | 8.58 |
| 44769.333333333336 | 8.5 |
| 44769.34375 | 8.21 |
| 44769.354166666664 | 7.86 |
| 44769.364583333336 | 7.67 |
| 44769.375 | 7.84 |
| 44769.385416666664 | 7.82 |
| 44769.395833333336 | 7.96 |
| 44769.40625 | 8.41 |
| 44769.416666666664 | 8.44 |
| 44769.427083333336 | 8.14 |
| 44769.4375 | 8.16 |
| 44769.447916666664 | 8.32 |
| 44769.458333333336 | 7.83 |
| 44769.46875 | 7.65 |
| 44769.479166666664 | 7.39 |
| 44769.489583333336 | 7.35 |
| 44769.5 | 7.42 |
| 44769.510416666664 | 6.94 |
| 44769.520833333336 | 6.88 |
| 44769.53125 | 5.48 |
| 44769.541666666664 | 5.85 |
| 44769.552083333336 | 6.68 |
| 44769.5625 | 6.34 |
| 44769.572916666664 | 6.18 |
| 44769.583333333336 | 6.18 |
| 44769.59375 | 6.51 |
| 44769.604166666664 | 6.98 |
| 44769.614583333336 | 7.34 |
| 44769.625 | 7.13 |
| 44769.635416666664 | 6.65 |
| 44769.645833333336 | 8.15 |
| 44769.65625 | 9.51 |
| 44769.666666666664 | 8.22 |
| 44769.677083333336 | 9.38 |
| 44769.6875 | 9.85 |
| 44769.697916666664 | 10.55 |
| 44769.708333333336 | 12.25 |
| 44769.71875 | 16.38 |
| 44769.729166666664 | 20.43 |
| 44769.739583333336 | 18.64 |
| 44769.75 | 22.72 |
| 44769.760416666664 | 29.47 |
| 44769.770833333336 | 33.64 |
| 44769.78125 | 28.7 |
| 44769.791666666664 | 25.54 |
| 44769.802083333336 | 28.2 |
| 44769.8125 | 27.79 |
| 44769.822916666664 | 26.84 |
| 44769.833333333336 | 21.56 |
| 44769.84375 | 18.25 |
| 44769.854166666664 | 15.61 |
| 44769.864583333336 | 13.36 |
| 44769.875 | 12.78 |
| 44769.885416666664 | 12.14 |
| 44769.895833333336 | 11.87 |
| 44769.90625 | 11.46 |
| 44769.916666666664 | 11.03 |
| 44769.927083333336 | 12 |
| 44769.9375 | 12.97 |
| 44769.947916666664 | 11.8 |
| 44769.958333333336 | 12.95 |
| 44769.96875 | 13.45 |
| 44769.979166666664 | 13.57 |
| 44769.989583333336 | 13.94 |
| 44770.0 | 15.23 |
| 44770.010416666664 | 15.05 |
| 44770.020833333336 | 15.7 |
| 44770.03125 | 12.3 |
| 44770.041666666664 | 16.24 |
| 44770.052083333336 | 12.4 |
| 44770.0625 | 14.28 |
| 44770.072916666664 | 11.99 |
| 44770.083333333336 | 11.57 |
| 44770.09375 | 11.89 |
| 44770.104166666664 | 10.35 |
| 44770.114583333336 | 9.56 |
| 44770.125 | 12.62 |
| 44770.135416666664 | 8.73 |
| 44770.145833333336 | 7.78 |
| 44770.15625 | 8.62 |
| 44770.166666666664 | 8.17 |
| 44770.177083333336 | 8.03 |
| 44770.1875 | 8.26 |
| 44770.197916666664 | 8.95 |
| 44770.208333333336 | 9.59 |
| 44770.21875 | 9.09 |
| 44770.229166666664 | 8.87 |
| 44770.239583333336 | 10.02 |
| 44770.25 | 10.73 |
| 44770.260416666664 | 11.21 |
| 44770.270833333336 | 10.68 |
| 44770.28125 | 11.68 |
| 44770.291666666664 | 10.65 |
| 44770.302083333336 | 10.85 |
| 44770.3125 | 11.01 |
| 44770.322916666664 | 10.01 |
| 44770.333333333336 | 9.34 |
| 44770.34375 | 9.98 |
| 44770.354166666664 | 8.97 |
| 44770.364583333336 | 9.29 |
| 44770.375 | 8.65 |
| 44770.385416666664 | 8.85 |
| 44770.395833333336 | 8.52 |
| 44770.40625 | 8.03 |
| 44770.416666666664 | 8.03 |
| 44770.427083333336 | 7.77 |
| 44770.4375 | 7.51 |
| 44770.447916666664 | 7.18 |
| 44770.458333333336 | 6.91 |
| 44770.46875 | 7.08 |
| 44770.479166666664 | 7.67 |
| 44770.489583333336 | 7.69 |
| 44770.5 | 7.73 |
| 44770.510416666664 | 7.7 |
| 44770.520833333336 | 6.94 |
| 44770.53125 | 6.5 |
| 44770.541666666664 | 6.67 |
| 44770.552083333336 | 6.6 |
| 44770.5625 | 6.32 |
| 44770.572916666664 | 6.13 |
| 44770.583333333336 | 6.56 |
| 44770.59375 | 8.67 |
| 44770.604166666664 | 6.33 |
| 44770.614583333336 | 7.05 |
| 44770.625 | 7.04 |
| 44770.635416666664 | 8.35 |
| 44770.645833333336 | 8.11 |
| 44770.65625 | 7.53 |
| 44770.666666666664 | 7.86 |
| 44770.677083333336 | 9.12 |
| 44770.6875 | 8.18 |
| 44770.697916666664 | 9.19 |
| 44770.708333333336 | 10.58 |
| 44770.71875 | 17.54 |
| 44770.729166666664 | 21.37 |
| 44770.739583333336 | 28.61 |
| 44770.75 | 32.42 |
| 44770.760416666664 | 38.79 |
| 44770.770833333336 | 50.88 |
| 44770.78125 | 55.61 |
| 44770.791666666664 | 49.7 |
| 44770.802083333336 | 54.57 |
| 44770.8125 | 64.17 |
| 44770.822916666664 | 55.41 |
| 44770.833333333336 | 58.79 |
| 44770.84375 | 57.47 |
| 44770.854166666664 | 52.65 |
| 44770.864583333336 | 45.06 |
| 44770.875 | 31.68 |
| 44770.885416666664 | 25.46 |
| 44770.895833333336 | 21.18 |
| 44770.90625 | 18.69 |
| 44770.916666666664 | 17.04 |
| 44770.927083333336 | 15.47 |
| 44770.9375 | 15.15 |
| 44770.947916666664 | 15.06 |
| 44770.958333333336 | 15.07 |
| 44770.96875 | 15.42 |
| 44770.979166666664 | 16.69 |
| 44770.989583333336 | 18.14 |
| 44771.0 | 19.36 |
| 44771.010416666664 | 19.25 |
| 44771.020833333336 | 18.83 |
| 44771.03125 | 19.16 |
| 44771.041666666664 | 18.98 |
| 44771.052083333336 | 18.78 |
| 44771.0625 | 18.01 |
| 44771.072916666664 | 17.88 |
| 44771.083333333336 | 17.21 |
| 44771.09375 | 16.88 |
| 44771.104166666664 | 16.74 |
| 44771.114583333336 | 15.3 |
| 44771.125 | 15.08 |
| 44771.135416666664 | 16.21 |
| 44771.145833333336 | 14.58 |
| 44771.15625 | 15.75 |
| 44771.166666666664 | 15.53 |
| 44771.177083333336 | 12.98 |
| 44771.1875 | 11.81 |
| 44771.197916666664 | 9.78 |
| 44771.208333333336 | 11.14 |
| 44771.21875 | 11.41 |
| 44771.229166666664 | 11.09 |
| 44771.239583333336 | 10.54 |
| 44771.25 | 12.18 |
| 44771.260416666664 | 12.6 |
| 44771.270833333336 | 12.67 |
| 44771.28125 | 12.44 |
| 44771.291666666664 | 13.15 |
| 44771.302083333336 | 12.86 |
| 44771.3125 | 13.29 |
| 44771.322916666664 | 13.53 |
| 44771.333333333336 | 12.45 |
| 44771.34375 | 10.95 |
| 44771.354166666664 | 11.04 |
| 44771.364583333336 | 10.89 |
| 44771.375 | 10.41 |
| 44771.385416666664 | 9 |
| 44771.395833333336 | 9.49 |
| 44771.40625 | 9.92 |
| 44771.416666666664 | 8.64 |
| 44771.427083333336 | 8.38 |
| 44771.4375 | 8.44 |
| 44771.447916666664 | 7.95 |
| 44771.458333333336 | 8.72 |
| 44771.46875 | 7.81 |
| 44771.479166666664 | 7.75 |
| 44771.489583333336 | 7.99 |
| 44771.5 | 7.72 |
| 44771.510416666664 | 7.2 |
| 44771.520833333336 | 7.7 |
| 44771.53125 | 8.12 |
| 44771.541666666664 | 8.21 |
| 44771.552083333336 | 7.95 |
| 44771.5625 | 8.78 |
| 44771.572916666664 | 7.98 |
| 44771.583333333336 | 7.09 |
| 44771.59375 | 6.8 |
| 44771.604166666664 | 7.69 |
| 44771.614583333336 | 7.69 |
| 44771.625 | 6.95 |
| 44771.635416666664 | 8.59 |
| 44771.645833333336 | 8.71 |
| 44771.65625 | 8.63 |
| 44771.666666666664 | 8.29 |
| 44771.677083333336 | 8.65 |
| 44771.6875 | 8.46 |
| 44771.697916666664 | 9.06 |
| 44771.708333333336 | 11.49 |
| 44771.71875 | 13.56 |
| 44771.729166666664 | 15.84 |
| 44771.739583333336 | 22.66 |
| 44771.75 | 27.76 |
| 44771.760416666664 | 33.44 |
| 44771.770833333336 | 41.03 |
| 44771.78125 | 46.95 |
| 44771.791666666664 | 49.7 |
| 44771.802083333336 | 66.67 |
| 44771.8125 | 67.48 |
| 44771.822916666664 | 69.3 |
| 44771.833333333336 | 65.37 |
| 44771.84375 | 63.43 |
| 44771.854166666664 | 62.26 |
| 44771.864583333336 | 59.24 |
| 44771.875 | 48.5 |
| 44771.885416666664 | 37.58 |
| 44771.895833333336 | 30.61 |
| 44771.90625 | 25.71 |
| 44771.916666666664 | 23.1 |
| 44771.927083333336 | 20.67 |
| 44771.9375 | 18.97 |
| 44771.947916666664 | 17.58 |
| 44771.958333333336 | 17.76 |
| 44771.96875 | 16.52 |
| 44771.979166666664 | 15.82 |
| 44771.989583333336 | 15.1 |
| 44772.0 | 15.99 |
| 44772.010416666664 | 17.43 |
| 44772.020833333336 | 17.25 |
| 44772.03125 | 18.76 |
| 44772.041666666664 | 18.45 |
| 44772.052083333336 | 16.85 |
| 44772.0625 | 15.4 |
| 44772.072916666664 | 15.81 |
| 44772.083333333336 | 14.32 |
| 44772.09375 | 14.76 |
| 44772.104166666664 | 12.86 |
| 44772.114583333336 | 14 |
| 44772.125 | 11.67 |
| 44772.135416666664 | 10.72 |
| 44772.145833333336 | 12.15 |
| 44772.15625 | 11.25 |
| 44772.166666666664 | 11.37 |
| 44772.177083333336 | 10.61 |
| 44772.1875 | 9.94 |
| 44772.197916666664 | 9.93 |
| 44772.208333333336 | 11.27 |
| 44772.21875 | 9.47 |
| 44772.229166666664 | 9.73 |
| 44772.239583333336 | 9.08 |
| 44772.25 | 10.38 |
| 44772.260416666664 | 9.89 |
| 44772.270833333336 | 11.06 |
| 44772.28125 | 10.2 |
| 44772.291666666664 | 10.22 |
| 44772.302083333336 | 9.92 |
| 44772.3125 | 10.4 |
| 44772.322916666664 | 10.32 |
| 44772.333333333336 | 11.01 |
| 44772.34375 | 10.86 |
| 44772.354166666664 | 11.5 |
| 44772.364583333336 | 11.65 |
| 44772.375 | 10.62 |
| 44772.385416666664 | 10.48 |
| 44772.395833333336 | 10.73 |
| 44772.40625 | 9.79 |
| 44772.416666666664 | 9.89 |
| 44772.427083333336 | 9.54 |
| 44772.4375 | 9.35 |
| 44772.447916666664 | 8.87 |
| 44772.458333333336 | 8.77 |
| 44772.46875 | 8.53 |
| 44772.479166666664 | 8.51 |
| 44772.489583333336 | 8.19 |
| 44772.5 | 7.61 |
| 44772.510416666664 | 7.81 |
| 44772.520833333336 | 7.72 |
| 44772.53125 | 7.78 |
| 44772.541666666664 | 7.92 |
| 44772.552083333336 | 7.59 |
| 44772.5625 | 7.33 |
| 44772.572916666664 | 7.08 |
| 44772.583333333336 | 8.56 |
| 44772.59375 | 7.3 |
| 44772.604166666664 | 8.01 |
| 44772.614583333336 | 7.17 |
| 44772.625 | 6.87 |
| 44772.635416666664 | 8.81 |
| 44772.645833333336 | 9.58 |
| 44772.65625 | 8.88 |
| 44772.666666666664 | 9.19 |
| 44772.677083333336 | 9.47 |
| 44772.6875 | 9.87 |
| 44772.697916666664 | 9.16 |
| 44772.708333333336 | 8.96 |
| 44772.71875 | 9.48 |
| 44772.729166666664 | 9.71 |
| 44772.739583333336 | 11.68 |
| 44772.75 | 14.95 |
| 44772.760416666664 | 15.95 |
| 44772.770833333336 | 20.53 |
| 44772.78125 | 21.12 |
| 44772.791666666664 | 22.57 |
| 44772.802083333336 | 29.83 |
| 44772.8125 | 32.37 |
| 44772.822916666664 | 38.34 |
| 44772.833333333336 | 50.69 |
| 44772.84375 | 56.84 |
| 44772.854166666664 | 59.02 |
| 44772.864583333336 | 66 |
| 44772.875 | 51.21 |
| 44772.885416666664 | 45.69 |
| 44772.895833333336 | 42.86 |
| 44772.90625 | 37.13 |
| 44772.916666666664 | 32.14 |
| 44772.927083333336 | 26.66 |
| 44772.9375 | 24.01 |
| 44772.947916666664 | 19.96 |
| 44772.958333333336 | 18.01 |
| 44772.96875 | 15.37 |
| 44772.979166666664 | 14.12 |
| 44772.989583333336 | 14.1 |
| 44773.0 | 15.82 |
| 44773.010416666664 | 15.16 |
| 44773.020833333336 | 15.72 |
| 44773.03125 | 15.59 |
| 44773.041666666664 | 16.08 |
| 44773.052083333336 | 16.22 |
| 44773.0625 | 16.85 |
| 44773.072916666664 | 16.78 |
| 44773.083333333336 | 15.98 |
| 44773.09375 | 15.76 |
| 44773.104166666664 | 15.55 |
| 44773.114583333336 | 14.98 |
| 44773.125 | 15.56 |
| 44773.135416666664 | 15.01 |
| 44773.145833333336 | 13.22 |
| 44773.15625 | 14.67 |
| 44773.166666666664 | 14.12 |
| 44773.177083333336 | 13.08 |
| 44773.1875 | 12.5 |
| 44773.197916666664 | 12.15 |
| 44773.208333333336 | 11.02 |
| 44773.21875 | 10.94 |
| 44773.229166666664 | 10.36 |
| 44773.239583333336 | 10.72 |
| 44773.25 | 9.65 |
| 44773.260416666664 | 10.25 |
| 44773.270833333336 | 11.96 |
| 44773.28125 | 12.24 |
| 44773.291666666664 | 13.86 |
| 44773.302083333336 | 14.24 |
| 44773.3125 | 14.25 |
| 44773.322916666664 | 14.05 |
| 44773.333333333336 | 14.2 |
| 44773.34375 | 15.12 |
| 44773.354166666664 | 15.36 |
| 44773.364583333336 | 13.92 |
| 44773.375 | 13.87 |
| 44773.385416666664 | 14.78 |
| 44773.395833333336 | 13.36 |
| 44773.40625 | 12.7 |
| 44773.416666666664 | 13.07 |
| 44773.427083333336 | 13.56 |
| 44773.4375 | 12.84 |
| 44773.447916666664 | 12.5 |
| 44773.458333333336 | 12.09 |
| 44773.46875 | 11.63 |
| 44773.479166666664 | 11.29 |
| 44773.489583333336 | 10.96 |
| 44773.5 | 10.64 |
| 44773.510416666664 | 10.61 |
| 44773.520833333336 | 10.14 |
| 44773.53125 | 9.92 |
| 44773.541666666664 | 9.7 |
| 44773.552083333336 | 10.09 |
| 44773.5625 | 11.1 |
| 44773.572916666664 | 10.65 |
| 44773.583333333336 | 11.47 |
| 44773.59375 | 9.69 |
| 44773.604166666664 | 10.18 |
| 44773.614583333336 | 10.41 |
| 44773.625 | 10.04 |
| 44773.635416666664 | 10.69 |
| 44773.645833333336 | 10.2 |
| 44773.65625 | 11.98 |
| 44773.666666666664 | 12.19 |
| 44773.677083333336 | 11.08 |
| 44773.6875 | 10.24 |
| 44773.697916666664 | 10.04 |
| 44773.708333333336 | 10.3 |
| 44773.71875 | 10.27 |
| 44773.729166666664 | 11.41 |
| 44773.739583333336 | 10.98 |
| 44773.75 | 13 |
| 44773.760416666664 | 14.73 |
| 44773.770833333336 | 17.93 |
| 44773.78125 | 21.03 |
| 44773.791666666664 | 25.21 |
| 44773.802083333336 | 30.35 |
| 44773.8125 | 34.21 |
| 44773.822916666664 | 35.42 |
| 44773.833333333336 | 43.64 |
| 44773.84375 | 44.43 |
| 44773.854166666664 | 47.47 |
| 44773.864583333336 | 50.74 |
| 44773.875 | 52.66 |
| 44773.885416666664 | 57.6 |
| 44773.895833333336 | 55.06 |
| 44773.90625 | 48.82 |
| 44773.916666666664 | 39.87 |
| 44773.927083333336 | 38.95 |
| 44773.9375 | 31.75 |
| 44773.947916666664 | 28.38 |
| 44773.958333333336 | 28.69 |
| 44773.96875 | 27.49 |
| 44773.979166666664 | 25.96 |
| 44773.989583333336 | 24.91 |
| 44774.0 | 23.75 |
| 44774.010416666664 | 24.07 |
| 44774.020833333336 | 25.91 |
| 44774.03125 | 24.12 |
| 44774.041666666664 | 22.05 |
| 44774.052083333336 | 21.15 |
| 44774.0625 | 22.12 |
| 44774.072916666664 | 21.74 |
| 44774.083333333336 | 21.72 |
| 44774.09375 | 20.83 |
| 44774.104166666664 | 19.6 |
| 44774.114583333336 | 19.46 |
| 44774.125 | 19.08 |
| 44774.135416666664 | 17.48 |
| 44774.145833333336 | 17.15 |
| 44774.15625 | 17.39 |